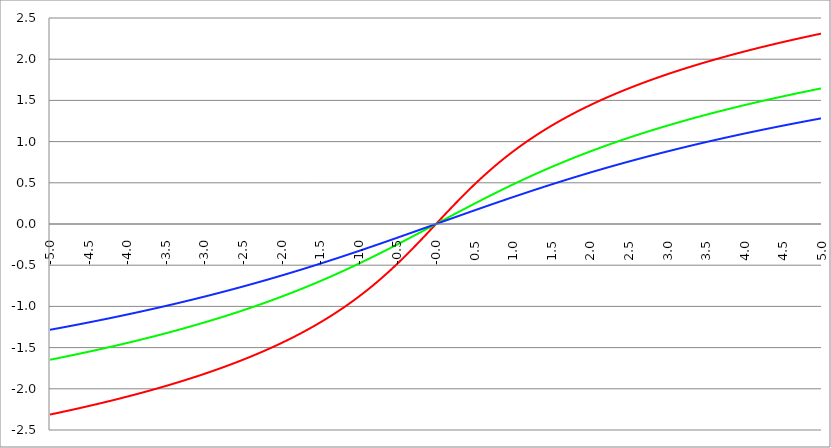
| Category | Series 1 | Series 0 | Series 2 |
|---|---|---|---|
| -5.0 | -2.312 | -1.647 | -1.284 |
| -4.995 | -2.311 | -1.646 | -1.283 |
| -4.99 | -2.31 | -1.645 | -1.282 |
| -4.985 | -2.309 | -1.644 | -1.281 |
| -4.98 | -2.309 | -1.644 | -1.28 |
| -4.975 | -2.308 | -1.643 | -1.28 |
| -4.97 | -2.307 | -1.642 | -1.279 |
| -4.965000000000001 | -2.306 | -1.641 | -1.278 |
| -4.960000000000001 | -2.305 | -1.64 | -1.277 |
| -4.955000000000001 | -2.304 | -1.639 | -1.276 |
| -4.950000000000001 | -2.303 | -1.638 | -1.275 |
| -4.945000000000001 | -2.302 | -1.637 | -1.274 |
| -4.940000000000001 | -2.301 | -1.636 | -1.273 |
| -4.935000000000001 | -2.3 | -1.635 | -1.273 |
| -4.930000000000001 | -2.299 | -1.634 | -1.272 |
| -4.925000000000002 | -2.298 | -1.633 | -1.271 |
| -4.920000000000002 | -2.297 | -1.632 | -1.27 |
| -4.915000000000002 | -2.296 | -1.631 | -1.269 |
| -4.910000000000002 | -2.295 | -1.63 | -1.268 |
| -4.905000000000002 | -2.294 | -1.629 | -1.267 |
| -4.900000000000002 | -2.293 | -1.628 | -1.267 |
| -4.895000000000002 | -2.292 | -1.628 | -1.266 |
| -4.890000000000002 | -2.291 | -1.627 | -1.265 |
| -4.885000000000002 | -2.29 | -1.626 | -1.264 |
| -4.880000000000002 | -2.289 | -1.625 | -1.263 |
| -4.875000000000003 | -2.288 | -1.624 | -1.262 |
| -4.870000000000003 | -2.287 | -1.623 | -1.261 |
| -4.865000000000003 | -2.286 | -1.622 | -1.26 |
| -4.860000000000003 | -2.285 | -1.621 | -1.26 |
| -4.855000000000003 | -2.284 | -1.62 | -1.259 |
| -4.850000000000003 | -2.283 | -1.619 | -1.258 |
| -4.845000000000003 | -2.282 | -1.618 | -1.257 |
| -4.840000000000003 | -2.281 | -1.617 | -1.256 |
| -4.835000000000003 | -2.28 | -1.616 | -1.255 |
| -4.830000000000004 | -2.279 | -1.615 | -1.254 |
| -4.825000000000004 | -2.278 | -1.614 | -1.253 |
| -4.820000000000004 | -2.277 | -1.613 | -1.253 |
| -4.815000000000004 | -2.275 | -1.612 | -1.252 |
| -4.810000000000004 | -2.274 | -1.611 | -1.251 |
| -4.805000000000004 | -2.273 | -1.61 | -1.25 |
| -4.800000000000004 | -2.272 | -1.609 | -1.249 |
| -4.795000000000004 | -2.271 | -1.608 | -1.248 |
| -4.790000000000004 | -2.27 | -1.608 | -1.247 |
| -4.785000000000004 | -2.269 | -1.607 | -1.246 |
| -4.780000000000004 | -2.268 | -1.606 | -1.245 |
| -4.775000000000004 | -2.267 | -1.605 | -1.245 |
| -4.770000000000004 | -2.266 | -1.604 | -1.244 |
| -4.765000000000005 | -2.265 | -1.603 | -1.243 |
| -4.760000000000005 | -2.264 | -1.602 | -1.242 |
| -4.755000000000005 | -2.263 | -1.601 | -1.241 |
| -4.750000000000005 | -2.262 | -1.6 | -1.24 |
| -4.745000000000005 | -2.261 | -1.599 | -1.239 |
| -4.740000000000005 | -2.26 | -1.598 | -1.238 |
| -4.735000000000005 | -2.259 | -1.597 | -1.237 |
| -4.730000000000005 | -2.258 | -1.596 | -1.237 |
| -4.725000000000006 | -2.257 | -1.595 | -1.236 |
| -4.720000000000006 | -2.256 | -1.594 | -1.235 |
| -4.715000000000006 | -2.255 | -1.593 | -1.234 |
| -4.710000000000006 | -2.254 | -1.592 | -1.233 |
| -4.705000000000006 | -2.253 | -1.591 | -1.232 |
| -4.700000000000006 | -2.252 | -1.59 | -1.231 |
| -4.695000000000006 | -2.251 | -1.589 | -1.23 |
| -4.690000000000006 | -2.25 | -1.588 | -1.229 |
| -4.685000000000007 | -2.249 | -1.587 | -1.228 |
| -4.680000000000007 | -2.248 | -1.586 | -1.228 |
| -4.675000000000007 | -2.247 | -1.585 | -1.227 |
| -4.670000000000007 | -2.246 | -1.584 | -1.226 |
| -4.665000000000007 | -2.245 | -1.583 | -1.225 |
| -4.660000000000007 | -2.243 | -1.582 | -1.224 |
| -4.655000000000007 | -2.242 | -1.581 | -1.223 |
| -4.650000000000007 | -2.241 | -1.58 | -1.222 |
| -4.645000000000007 | -2.24 | -1.579 | -1.221 |
| -4.640000000000008 | -2.239 | -1.578 | -1.22 |
| -4.635000000000008 | -2.238 | -1.577 | -1.219 |
| -4.630000000000008 | -2.237 | -1.576 | -1.219 |
| -4.625000000000008 | -2.236 | -1.575 | -1.218 |
| -4.620000000000008 | -2.235 | -1.574 | -1.217 |
| -4.615000000000008 | -2.234 | -1.573 | -1.216 |
| -4.610000000000008 | -2.233 | -1.572 | -1.215 |
| -4.605000000000008 | -2.232 | -1.571 | -1.214 |
| -4.600000000000008 | -2.231 | -1.57 | -1.213 |
| -4.595000000000009 | -2.23 | -1.569 | -1.212 |
| -4.590000000000009 | -2.229 | -1.568 | -1.211 |
| -4.585000000000009 | -2.228 | -1.567 | -1.21 |
| -4.580000000000009 | -2.227 | -1.566 | -1.209 |
| -4.57500000000001 | -2.225 | -1.565 | -1.209 |
| -4.57000000000001 | -2.224 | -1.564 | -1.208 |
| -4.565000000000009 | -2.223 | -1.563 | -1.207 |
| -4.560000000000009 | -2.222 | -1.562 | -1.206 |
| -4.555000000000009 | -2.221 | -1.561 | -1.205 |
| -4.55000000000001 | -2.22 | -1.56 | -1.204 |
| -4.54500000000001 | -2.219 | -1.559 | -1.203 |
| -4.54000000000001 | -2.218 | -1.558 | -1.202 |
| -4.53500000000001 | -2.217 | -1.557 | -1.201 |
| -4.53000000000001 | -2.216 | -1.556 | -1.2 |
| -4.52500000000001 | -2.215 | -1.555 | -1.199 |
| -4.52000000000001 | -2.214 | -1.554 | -1.198 |
| -4.51500000000001 | -2.213 | -1.553 | -1.198 |
| -4.51000000000001 | -2.212 | -1.552 | -1.197 |
| -4.505000000000011 | -2.21 | -1.551 | -1.196 |
| -4.500000000000011 | -2.209 | -1.55 | -1.195 |
| -4.495000000000011 | -2.208 | -1.549 | -1.194 |
| -4.490000000000011 | -2.207 | -1.548 | -1.193 |
| -4.485000000000011 | -2.206 | -1.547 | -1.192 |
| -4.480000000000011 | -2.205 | -1.546 | -1.191 |
| -4.475000000000011 | -2.204 | -1.545 | -1.19 |
| -4.470000000000011 | -2.203 | -1.544 | -1.189 |
| -4.465000000000011 | -2.202 | -1.543 | -1.188 |
| -4.460000000000011 | -2.201 | -1.542 | -1.187 |
| -4.455000000000012 | -2.2 | -1.541 | -1.186 |
| -4.450000000000012 | -2.198 | -1.54 | -1.185 |
| -4.445000000000012 | -2.197 | -1.539 | -1.185 |
| -4.440000000000012 | -2.196 | -1.538 | -1.184 |
| -4.435000000000012 | -2.195 | -1.537 | -1.183 |
| -4.430000000000012 | -2.194 | -1.536 | -1.182 |
| -4.425000000000012 | -2.193 | -1.535 | -1.181 |
| -4.420000000000012 | -2.192 | -1.534 | -1.18 |
| -4.415000000000012 | -2.191 | -1.533 | -1.179 |
| -4.410000000000013 | -2.19 | -1.532 | -1.178 |
| -4.405000000000013 | -2.189 | -1.531 | -1.177 |
| -4.400000000000013 | -2.187 | -1.53 | -1.176 |
| -4.395000000000013 | -2.186 | -1.529 | -1.175 |
| -4.390000000000013 | -2.185 | -1.528 | -1.174 |
| -4.385000000000013 | -2.184 | -1.527 | -1.173 |
| -4.380000000000013 | -2.183 | -1.526 | -1.172 |
| -4.375000000000013 | -2.182 | -1.524 | -1.171 |
| -4.370000000000013 | -2.181 | -1.523 | -1.17 |
| -4.365000000000013 | -2.18 | -1.522 | -1.17 |
| -4.360000000000014 | -2.179 | -1.521 | -1.169 |
| -4.355000000000014 | -2.177 | -1.52 | -1.168 |
| -4.350000000000014 | -2.176 | -1.519 | -1.167 |
| -4.345000000000014 | -2.175 | -1.518 | -1.166 |
| -4.340000000000014 | -2.174 | -1.517 | -1.165 |
| -4.335000000000014 | -2.173 | -1.516 | -1.164 |
| -4.330000000000014 | -2.172 | -1.515 | -1.163 |
| -4.325000000000014 | -2.171 | -1.514 | -1.162 |
| -4.320000000000014 | -2.17 | -1.513 | -1.161 |
| -4.315000000000015 | -2.168 | -1.512 | -1.16 |
| -4.310000000000015 | -2.167 | -1.511 | -1.159 |
| -4.305000000000015 | -2.166 | -1.51 | -1.158 |
| -4.300000000000015 | -2.165 | -1.509 | -1.157 |
| -4.295000000000015 | -2.164 | -1.508 | -1.156 |
| -4.290000000000015 | -2.163 | -1.507 | -1.155 |
| -4.285000000000015 | -2.162 | -1.506 | -1.154 |
| -4.280000000000015 | -2.16 | -1.505 | -1.153 |
| -4.275000000000015 | -2.159 | -1.503 | -1.152 |
| -4.270000000000015 | -2.158 | -1.502 | -1.151 |
| -4.265000000000016 | -2.157 | -1.501 | -1.151 |
| -4.260000000000016 | -2.156 | -1.5 | -1.15 |
| -4.255000000000016 | -2.155 | -1.499 | -1.149 |
| -4.250000000000016 | -2.154 | -1.498 | -1.148 |
| -4.245000000000016 | -2.152 | -1.497 | -1.147 |
| -4.240000000000016 | -2.151 | -1.496 | -1.146 |
| -4.235000000000016 | -2.15 | -1.495 | -1.145 |
| -4.230000000000016 | -2.149 | -1.494 | -1.144 |
| -4.225000000000017 | -2.148 | -1.493 | -1.143 |
| -4.220000000000017 | -2.147 | -1.492 | -1.142 |
| -4.215000000000017 | -2.146 | -1.491 | -1.141 |
| -4.210000000000017 | -2.144 | -1.49 | -1.14 |
| -4.205000000000017 | -2.143 | -1.489 | -1.139 |
| -4.200000000000017 | -2.142 | -1.487 | -1.138 |
| -4.195000000000017 | -2.141 | -1.486 | -1.137 |
| -4.190000000000017 | -2.14 | -1.485 | -1.136 |
| -4.185000000000017 | -2.139 | -1.484 | -1.135 |
| -4.180000000000017 | -2.137 | -1.483 | -1.134 |
| -4.175000000000018 | -2.136 | -1.482 | -1.133 |
| -4.170000000000018 | -2.135 | -1.481 | -1.132 |
| -4.165000000000018 | -2.134 | -1.48 | -1.131 |
| -4.160000000000018 | -2.133 | -1.479 | -1.13 |
| -4.155000000000018 | -2.132 | -1.478 | -1.129 |
| -4.150000000000018 | -2.13 | -1.477 | -1.128 |
| -4.145000000000018 | -2.129 | -1.476 | -1.127 |
| -4.140000000000018 | -2.128 | -1.475 | -1.126 |
| -4.135000000000018 | -2.127 | -1.473 | -1.125 |
| -4.130000000000019 | -2.126 | -1.472 | -1.124 |
| -4.125000000000019 | -2.125 | -1.471 | -1.123 |
| -4.120000000000019 | -2.123 | -1.47 | -1.122 |
| -4.115000000000019 | -2.122 | -1.469 | -1.121 |
| -4.110000000000019 | -2.121 | -1.468 | -1.12 |
| -4.105000000000019 | -2.12 | -1.467 | -1.119 |
| -4.100000000000019 | -2.119 | -1.466 | -1.118 |
| -4.095000000000019 | -2.117 | -1.465 | -1.117 |
| -4.090000000000019 | -2.116 | -1.464 | -1.116 |
| -4.085000000000019 | -2.115 | -1.462 | -1.115 |
| -4.08000000000002 | -2.114 | -1.461 | -1.115 |
| -4.07500000000002 | -2.113 | -1.46 | -1.114 |
| -4.07000000000002 | -2.112 | -1.459 | -1.113 |
| -4.06500000000002 | -2.11 | -1.458 | -1.112 |
| -4.06000000000002 | -2.109 | -1.457 | -1.111 |
| -4.05500000000002 | -2.108 | -1.456 | -1.11 |
| -4.05000000000002 | -2.107 | -1.455 | -1.109 |
| -4.04500000000002 | -2.106 | -1.454 | -1.108 |
| -4.04000000000002 | -2.104 | -1.453 | -1.107 |
| -4.03500000000002 | -2.103 | -1.451 | -1.106 |
| -4.03000000000002 | -2.102 | -1.45 | -1.105 |
| -4.025000000000021 | -2.101 | -1.449 | -1.104 |
| -4.020000000000021 | -2.1 | -1.448 | -1.103 |
| -4.015000000000021 | -2.098 | -1.447 | -1.102 |
| -4.010000000000021 | -2.097 | -1.446 | -1.101 |
| -4.005000000000021 | -2.096 | -1.445 | -1.1 |
| -4.000000000000021 | -2.095 | -1.444 | -1.099 |
| -3.995000000000021 | -2.093 | -1.443 | -1.098 |
| -3.990000000000021 | -2.092 | -1.441 | -1.097 |
| -3.985000000000022 | -2.091 | -1.44 | -1.096 |
| -3.980000000000022 | -2.09 | -1.439 | -1.095 |
| -3.975000000000022 | -2.089 | -1.438 | -1.094 |
| -3.970000000000022 | -2.087 | -1.437 | -1.093 |
| -3.965000000000022 | -2.086 | -1.436 | -1.092 |
| -3.960000000000022 | -2.085 | -1.435 | -1.091 |
| -3.955000000000022 | -2.084 | -1.434 | -1.09 |
| -3.950000000000022 | -2.083 | -1.432 | -1.089 |
| -3.945000000000022 | -2.081 | -1.431 | -1.088 |
| -3.940000000000023 | -2.08 | -1.43 | -1.087 |
| -3.935000000000023 | -2.079 | -1.429 | -1.086 |
| -3.930000000000023 | -2.078 | -1.428 | -1.085 |
| -3.925000000000023 | -2.076 | -1.427 | -1.084 |
| -3.920000000000023 | -2.075 | -1.426 | -1.083 |
| -3.915000000000023 | -2.074 | -1.424 | -1.081 |
| -3.910000000000023 | -2.073 | -1.423 | -1.08 |
| -3.905000000000023 | -2.071 | -1.422 | -1.079 |
| -3.900000000000023 | -2.07 | -1.421 | -1.078 |
| -3.895000000000023 | -2.069 | -1.42 | -1.077 |
| -3.890000000000024 | -2.068 | -1.419 | -1.076 |
| -3.885000000000024 | -2.066 | -1.418 | -1.075 |
| -3.880000000000024 | -2.065 | -1.416 | -1.074 |
| -3.875000000000024 | -2.064 | -1.415 | -1.073 |
| -3.870000000000024 | -2.063 | -1.414 | -1.072 |
| -3.865000000000024 | -2.061 | -1.413 | -1.071 |
| -3.860000000000024 | -2.06 | -1.412 | -1.07 |
| -3.855000000000024 | -2.059 | -1.411 | -1.069 |
| -3.850000000000024 | -2.058 | -1.41 | -1.068 |
| -3.845000000000025 | -2.056 | -1.408 | -1.067 |
| -3.840000000000025 | -2.055 | -1.407 | -1.066 |
| -3.835000000000025 | -2.054 | -1.406 | -1.065 |
| -3.830000000000025 | -2.053 | -1.405 | -1.064 |
| -3.825000000000025 | -2.051 | -1.404 | -1.063 |
| -3.820000000000025 | -2.05 | -1.403 | -1.062 |
| -3.815000000000025 | -2.049 | -1.401 | -1.061 |
| -3.810000000000025 | -2.048 | -1.4 | -1.06 |
| -3.805000000000025 | -2.046 | -1.399 | -1.059 |
| -3.800000000000026 | -2.045 | -1.398 | -1.058 |
| -3.795000000000026 | -2.044 | -1.397 | -1.057 |
| -3.790000000000026 | -2.042 | -1.396 | -1.056 |
| -3.785000000000026 | -2.041 | -1.394 | -1.055 |
| -3.780000000000026 | -2.04 | -1.393 | -1.054 |
| -3.775000000000026 | -2.039 | -1.392 | -1.053 |
| -3.770000000000026 | -2.037 | -1.391 | -1.052 |
| -3.765000000000026 | -2.036 | -1.39 | -1.051 |
| -3.760000000000026 | -2.035 | -1.389 | -1.05 |
| -3.755000000000026 | -2.034 | -1.387 | -1.049 |
| -3.750000000000027 | -2.032 | -1.386 | -1.048 |
| -3.745000000000027 | -2.031 | -1.385 | -1.047 |
| -3.740000000000027 | -2.03 | -1.384 | -1.046 |
| -3.735000000000027 | -2.028 | -1.383 | -1.044 |
| -3.730000000000027 | -2.027 | -1.382 | -1.043 |
| -3.725000000000027 | -2.026 | -1.38 | -1.042 |
| -3.720000000000027 | -2.024 | -1.379 | -1.041 |
| -3.715000000000027 | -2.023 | -1.378 | -1.04 |
| -3.710000000000027 | -2.022 | -1.377 | -1.039 |
| -3.705000000000028 | -2.021 | -1.376 | -1.038 |
| -3.700000000000028 | -2.019 | -1.374 | -1.037 |
| -3.695000000000028 | -2.018 | -1.373 | -1.036 |
| -3.690000000000028 | -2.017 | -1.372 | -1.035 |
| -3.685000000000028 | -2.015 | -1.371 | -1.034 |
| -3.680000000000028 | -2.014 | -1.37 | -1.033 |
| -3.675000000000028 | -2.013 | -1.369 | -1.032 |
| -3.670000000000028 | -2.011 | -1.367 | -1.031 |
| -3.665000000000028 | -2.01 | -1.366 | -1.03 |
| -3.660000000000028 | -2.009 | -1.365 | -1.029 |
| -3.655000000000029 | -2.007 | -1.364 | -1.028 |
| -3.650000000000029 | -2.006 | -1.363 | -1.027 |
| -3.645000000000029 | -2.005 | -1.361 | -1.026 |
| -3.640000000000029 | -2.003 | -1.36 | -1.024 |
| -3.635000000000029 | -2.002 | -1.359 | -1.023 |
| -3.630000000000029 | -2.001 | -1.358 | -1.022 |
| -3.625000000000029 | -2 | -1.356 | -1.021 |
| -3.620000000000029 | -1.998 | -1.355 | -1.02 |
| -3.615000000000029 | -1.997 | -1.354 | -1.019 |
| -3.61000000000003 | -1.996 | -1.353 | -1.018 |
| -3.60500000000003 | -1.994 | -1.352 | -1.017 |
| -3.60000000000003 | -1.993 | -1.35 | -1.016 |
| -3.59500000000003 | -1.991 | -1.349 | -1.015 |
| -3.59000000000003 | -1.99 | -1.348 | -1.014 |
| -3.58500000000003 | -1.989 | -1.347 | -1.013 |
| -3.58000000000003 | -1.987 | -1.346 | -1.012 |
| -3.57500000000003 | -1.986 | -1.344 | -1.011 |
| -3.57000000000003 | -1.985 | -1.343 | -1.01 |
| -3.565000000000031 | -1.983 | -1.342 | -1.008 |
| -3.560000000000031 | -1.982 | -1.341 | -1.007 |
| -3.555000000000031 | -1.981 | -1.339 | -1.006 |
| -3.550000000000031 | -1.979 | -1.338 | -1.005 |
| -3.545000000000031 | -1.978 | -1.337 | -1.004 |
| -3.540000000000031 | -1.977 | -1.336 | -1.003 |
| -3.535000000000031 | -1.975 | -1.335 | -1.002 |
| -3.530000000000031 | -1.974 | -1.333 | -1.001 |
| -3.525000000000031 | -1.973 | -1.332 | -1 |
| -3.520000000000032 | -1.971 | -1.331 | -0.999 |
| -3.515000000000032 | -1.97 | -1.33 | -0.998 |
| -3.510000000000032 | -1.968 | -1.328 | -0.997 |
| -3.505000000000032 | -1.967 | -1.327 | -0.996 |
| -3.500000000000032 | -1.966 | -1.326 | -0.994 |
| -3.495000000000032 | -1.964 | -1.325 | -0.993 |
| -3.490000000000032 | -1.963 | -1.323 | -0.992 |
| -3.485000000000032 | -1.962 | -1.322 | -0.991 |
| -3.480000000000032 | -1.96 | -1.321 | -0.99 |
| -3.475000000000032 | -1.959 | -1.32 | -0.989 |
| -3.470000000000033 | -1.957 | -1.318 | -0.988 |
| -3.465000000000033 | -1.956 | -1.317 | -0.987 |
| -3.460000000000033 | -1.955 | -1.316 | -0.986 |
| -3.455000000000033 | -1.953 | -1.315 | -0.985 |
| -3.450000000000033 | -1.952 | -1.313 | -0.984 |
| -3.445000000000033 | -1.951 | -1.312 | -0.982 |
| -3.440000000000033 | -1.949 | -1.311 | -0.981 |
| -3.435000000000033 | -1.948 | -1.31 | -0.98 |
| -3.430000000000033 | -1.946 | -1.308 | -0.979 |
| -3.425000000000034 | -1.945 | -1.307 | -0.978 |
| -3.420000000000034 | -1.944 | -1.306 | -0.977 |
| -3.415000000000034 | -1.942 | -1.305 | -0.976 |
| -3.410000000000034 | -1.941 | -1.303 | -0.975 |
| -3.405000000000034 | -1.939 | -1.302 | -0.974 |
| -3.400000000000034 | -1.938 | -1.301 | -0.973 |
| -3.395000000000034 | -1.936 | -1.3 | -0.971 |
| -3.390000000000034 | -1.935 | -1.298 | -0.97 |
| -3.385000000000034 | -1.934 | -1.297 | -0.969 |
| -3.380000000000034 | -1.932 | -1.296 | -0.968 |
| -3.375000000000035 | -1.931 | -1.294 | -0.967 |
| -3.370000000000035 | -1.929 | -1.293 | -0.966 |
| -3.365000000000035 | -1.928 | -1.292 | -0.965 |
| -3.360000000000035 | -1.927 | -1.291 | -0.964 |
| -3.355000000000035 | -1.925 | -1.289 | -0.963 |
| -3.350000000000035 | -1.924 | -1.288 | -0.962 |
| -3.345000000000035 | -1.922 | -1.287 | -0.96 |
| -3.340000000000035 | -1.921 | -1.286 | -0.959 |
| -3.335000000000035 | -1.919 | -1.284 | -0.958 |
| -3.330000000000036 | -1.918 | -1.283 | -0.957 |
| -3.325000000000036 | -1.916 | -1.282 | -0.956 |
| -3.320000000000036 | -1.915 | -1.28 | -0.955 |
| -3.315000000000036 | -1.914 | -1.279 | -0.954 |
| -3.310000000000036 | -1.912 | -1.278 | -0.953 |
| -3.305000000000036 | -1.911 | -1.276 | -0.951 |
| -3.300000000000036 | -1.909 | -1.275 | -0.95 |
| -3.295000000000036 | -1.908 | -1.274 | -0.949 |
| -3.290000000000036 | -1.906 | -1.273 | -0.948 |
| -3.285000000000036 | -1.905 | -1.271 | -0.947 |
| -3.280000000000036 | -1.903 | -1.27 | -0.946 |
| -3.275000000000037 | -1.902 | -1.269 | -0.945 |
| -3.270000000000037 | -1.901 | -1.267 | -0.944 |
| -3.265000000000037 | -1.899 | -1.266 | -0.942 |
| -3.260000000000037 | -1.898 | -1.265 | -0.941 |
| -3.255000000000037 | -1.896 | -1.263 | -0.94 |
| -3.250000000000037 | -1.895 | -1.262 | -0.939 |
| -3.245000000000037 | -1.893 | -1.261 | -0.938 |
| -3.240000000000037 | -1.892 | -1.26 | -0.937 |
| -3.235000000000038 | -1.89 | -1.258 | -0.936 |
| -3.230000000000038 | -1.889 | -1.257 | -0.935 |
| -3.225000000000038 | -1.887 | -1.256 | -0.933 |
| -3.220000000000038 | -1.886 | -1.254 | -0.932 |
| -3.215000000000038 | -1.884 | -1.253 | -0.931 |
| -3.210000000000038 | -1.883 | -1.252 | -0.93 |
| -3.205000000000038 | -1.881 | -1.25 | -0.929 |
| -3.200000000000038 | -1.88 | -1.249 | -0.928 |
| -3.195000000000038 | -1.878 | -1.248 | -0.927 |
| -3.190000000000039 | -1.877 | -1.246 | -0.925 |
| -3.185000000000039 | -1.875 | -1.245 | -0.924 |
| -3.180000000000039 | -1.874 | -1.244 | -0.923 |
| -3.175000000000039 | -1.872 | -1.242 | -0.922 |
| -3.170000000000039 | -1.871 | -1.241 | -0.921 |
| -3.16500000000004 | -1.869 | -1.24 | -0.92 |
| -3.16000000000004 | -1.868 | -1.238 | -0.919 |
| -3.155000000000039 | -1.866 | -1.237 | -0.917 |
| -3.150000000000039 | -1.865 | -1.236 | -0.916 |
| -3.14500000000004 | -1.863 | -1.234 | -0.915 |
| -3.14000000000004 | -1.862 | -1.233 | -0.914 |
| -3.13500000000004 | -1.86 | -1.232 | -0.913 |
| -3.13000000000004 | -1.859 | -1.23 | -0.912 |
| -3.12500000000004 | -1.857 | -1.229 | -0.911 |
| -3.12000000000004 | -1.856 | -1.228 | -0.909 |
| -3.11500000000004 | -1.854 | -1.226 | -0.908 |
| -3.11000000000004 | -1.853 | -1.225 | -0.907 |
| -3.10500000000004 | -1.851 | -1.224 | -0.906 |
| -3.10000000000004 | -1.85 | -1.222 | -0.905 |
| -3.095000000000041 | -1.848 | -1.221 | -0.904 |
| -3.090000000000041 | -1.847 | -1.219 | -0.902 |
| -3.085000000000041 | -1.845 | -1.218 | -0.901 |
| -3.080000000000041 | -1.843 | -1.217 | -0.9 |
| -3.075000000000041 | -1.842 | -1.215 | -0.899 |
| -3.070000000000041 | -1.84 | -1.214 | -0.898 |
| -3.065000000000041 | -1.839 | -1.213 | -0.897 |
| -3.060000000000041 | -1.837 | -1.211 | -0.895 |
| -3.055000000000041 | -1.836 | -1.21 | -0.894 |
| -3.050000000000042 | -1.834 | -1.209 | -0.893 |
| -3.045000000000042 | -1.833 | -1.207 | -0.892 |
| -3.040000000000042 | -1.831 | -1.206 | -0.891 |
| -3.035000000000042 | -1.829 | -1.204 | -0.89 |
| -3.030000000000042 | -1.828 | -1.203 | -0.888 |
| -3.025000000000042 | -1.826 | -1.202 | -0.887 |
| -3.020000000000042 | -1.825 | -1.2 | -0.886 |
| -3.015000000000042 | -1.823 | -1.199 | -0.885 |
| -3.010000000000042 | -1.822 | -1.198 | -0.884 |
| -3.005000000000043 | -1.82 | -1.196 | -0.883 |
| -3.000000000000043 | -1.818 | -1.195 | -0.881 |
| -2.995000000000043 | -1.817 | -1.193 | -0.88 |
| -2.990000000000043 | -1.815 | -1.192 | -0.879 |
| -2.985000000000043 | -1.814 | -1.191 | -0.878 |
| -2.980000000000043 | -1.812 | -1.189 | -0.877 |
| -2.975000000000043 | -1.811 | -1.188 | -0.875 |
| -2.970000000000043 | -1.809 | -1.186 | -0.874 |
| -2.965000000000043 | -1.807 | -1.185 | -0.873 |
| -2.960000000000043 | -1.806 | -1.184 | -0.872 |
| -2.955000000000044 | -1.804 | -1.182 | -0.871 |
| -2.950000000000044 | -1.803 | -1.181 | -0.87 |
| -2.945000000000044 | -1.801 | -1.179 | -0.868 |
| -2.940000000000044 | -1.799 | -1.178 | -0.867 |
| -2.935000000000044 | -1.798 | -1.177 | -0.866 |
| -2.930000000000044 | -1.796 | -1.175 | -0.865 |
| -2.925000000000044 | -1.794 | -1.174 | -0.864 |
| -2.920000000000044 | -1.793 | -1.172 | -0.862 |
| -2.915000000000044 | -1.791 | -1.171 | -0.861 |
| -2.910000000000045 | -1.79 | -1.17 | -0.86 |
| -2.905000000000045 | -1.788 | -1.168 | -0.859 |
| -2.900000000000045 | -1.786 | -1.167 | -0.858 |
| -2.895000000000045 | -1.785 | -1.165 | -0.856 |
| -2.890000000000045 | -1.783 | -1.164 | -0.855 |
| -2.885000000000045 | -1.781 | -1.162 | -0.854 |
| -2.880000000000045 | -1.78 | -1.161 | -0.853 |
| -2.875000000000045 | -1.778 | -1.16 | -0.852 |
| -2.870000000000045 | -1.777 | -1.158 | -0.85 |
| -2.865000000000045 | -1.775 | -1.157 | -0.849 |
| -2.860000000000046 | -1.773 | -1.155 | -0.848 |
| -2.855000000000046 | -1.772 | -1.154 | -0.847 |
| -2.850000000000046 | -1.77 | -1.152 | -0.846 |
| -2.845000000000046 | -1.768 | -1.151 | -0.844 |
| -2.840000000000046 | -1.767 | -1.15 | -0.843 |
| -2.835000000000046 | -1.765 | -1.148 | -0.842 |
| -2.830000000000046 | -1.763 | -1.147 | -0.841 |
| -2.825000000000046 | -1.762 | -1.145 | -0.84 |
| -2.820000000000046 | -1.76 | -1.144 | -0.838 |
| -2.815000000000047 | -1.758 | -1.142 | -0.837 |
| -2.810000000000047 | -1.757 | -1.141 | -0.836 |
| -2.805000000000047 | -1.755 | -1.139 | -0.835 |
| -2.800000000000047 | -1.753 | -1.138 | -0.833 |
| -2.795000000000047 | -1.752 | -1.137 | -0.832 |
| -2.790000000000047 | -1.75 | -1.135 | -0.831 |
| -2.785000000000047 | -1.748 | -1.134 | -0.83 |
| -2.780000000000047 | -1.746 | -1.132 | -0.829 |
| -2.775000000000047 | -1.745 | -1.131 | -0.827 |
| -2.770000000000047 | -1.743 | -1.129 | -0.826 |
| -2.765000000000048 | -1.741 | -1.128 | -0.825 |
| -2.760000000000048 | -1.74 | -1.126 | -0.824 |
| -2.755000000000048 | -1.738 | -1.125 | -0.822 |
| -2.750000000000048 | -1.736 | -1.123 | -0.821 |
| -2.745000000000048 | -1.735 | -1.122 | -0.82 |
| -2.740000000000048 | -1.733 | -1.12 | -0.819 |
| -2.735000000000048 | -1.731 | -1.119 | -0.818 |
| -2.730000000000048 | -1.729 | -1.117 | -0.816 |
| -2.725000000000048 | -1.728 | -1.116 | -0.815 |
| -2.720000000000049 | -1.726 | -1.115 | -0.814 |
| -2.715000000000049 | -1.724 | -1.113 | -0.813 |
| -2.710000000000049 | -1.723 | -1.112 | -0.811 |
| -2.705000000000049 | -1.721 | -1.11 | -0.81 |
| -2.700000000000049 | -1.719 | -1.109 | -0.809 |
| -2.695000000000049 | -1.717 | -1.107 | -0.808 |
| -2.690000000000049 | -1.716 | -1.106 | -0.806 |
| -2.685000000000049 | -1.714 | -1.104 | -0.805 |
| -2.680000000000049 | -1.712 | -1.103 | -0.804 |
| -2.675000000000049 | -1.71 | -1.101 | -0.803 |
| -2.67000000000005 | -1.709 | -1.1 | -0.801 |
| -2.66500000000005 | -1.707 | -1.098 | -0.8 |
| -2.66000000000005 | -1.705 | -1.097 | -0.799 |
| -2.65500000000005 | -1.703 | -1.095 | -0.798 |
| -2.65000000000005 | -1.702 | -1.094 | -0.796 |
| -2.64500000000005 | -1.7 | -1.092 | -0.795 |
| -2.64000000000005 | -1.698 | -1.091 | -0.794 |
| -2.63500000000005 | -1.696 | -1.089 | -0.793 |
| -2.63000000000005 | -1.694 | -1.088 | -0.791 |
| -2.625000000000051 | -1.693 | -1.086 | -0.79 |
| -2.620000000000051 | -1.691 | -1.085 | -0.789 |
| -2.615000000000051 | -1.689 | -1.083 | -0.788 |
| -2.610000000000051 | -1.687 | -1.081 | -0.786 |
| -2.605000000000051 | -1.686 | -1.08 | -0.785 |
| -2.600000000000051 | -1.684 | -1.078 | -0.784 |
| -2.595000000000051 | -1.682 | -1.077 | -0.783 |
| -2.590000000000051 | -1.68 | -1.075 | -0.781 |
| -2.585000000000051 | -1.678 | -1.074 | -0.78 |
| -2.580000000000052 | -1.677 | -1.072 | -0.779 |
| -2.575000000000052 | -1.675 | -1.071 | -0.778 |
| -2.570000000000052 | -1.673 | -1.069 | -0.776 |
| -2.565000000000052 | -1.671 | -1.068 | -0.775 |
| -2.560000000000052 | -1.669 | -1.066 | -0.774 |
| -2.555000000000052 | -1.667 | -1.065 | -0.773 |
| -2.550000000000052 | -1.666 | -1.063 | -0.771 |
| -2.545000000000052 | -1.664 | -1.062 | -0.77 |
| -2.540000000000052 | -1.662 | -1.06 | -0.769 |
| -2.535000000000053 | -1.66 | -1.058 | -0.767 |
| -2.530000000000053 | -1.658 | -1.057 | -0.766 |
| -2.525000000000053 | -1.656 | -1.055 | -0.765 |
| -2.520000000000053 | -1.655 | -1.054 | -0.764 |
| -2.515000000000053 | -1.653 | -1.052 | -0.762 |
| -2.510000000000053 | -1.651 | -1.051 | -0.761 |
| -2.505000000000053 | -1.649 | -1.049 | -0.76 |
| -2.500000000000053 | -1.647 | -1.048 | -0.758 |
| -2.495000000000053 | -1.645 | -1.046 | -0.757 |
| -2.490000000000053 | -1.644 | -1.044 | -0.756 |
| -2.485000000000054 | -1.642 | -1.043 | -0.755 |
| -2.480000000000054 | -1.64 | -1.041 | -0.753 |
| -2.475000000000054 | -1.638 | -1.04 | -0.752 |
| -2.470000000000054 | -1.636 | -1.038 | -0.751 |
| -2.465000000000054 | -1.634 | -1.037 | -0.749 |
| -2.460000000000054 | -1.632 | -1.035 | -0.748 |
| -2.455000000000054 | -1.63 | -1.033 | -0.747 |
| -2.450000000000054 | -1.628 | -1.032 | -0.746 |
| -2.445000000000054 | -1.627 | -1.03 | -0.744 |
| -2.440000000000055 | -1.625 | -1.029 | -0.743 |
| -2.435000000000055 | -1.623 | -1.027 | -0.742 |
| -2.430000000000055 | -1.621 | -1.026 | -0.74 |
| -2.425000000000055 | -1.619 | -1.024 | -0.739 |
| -2.420000000000055 | -1.617 | -1.022 | -0.738 |
| -2.415000000000055 | -1.615 | -1.021 | -0.737 |
| -2.410000000000055 | -1.613 | -1.019 | -0.735 |
| -2.405000000000055 | -1.611 | -1.018 | -0.734 |
| -2.400000000000055 | -1.609 | -1.016 | -0.733 |
| -2.395000000000055 | -1.608 | -1.014 | -0.731 |
| -2.390000000000056 | -1.606 | -1.013 | -0.73 |
| -2.385000000000056 | -1.604 | -1.011 | -0.729 |
| -2.380000000000056 | -1.602 | -1.01 | -0.727 |
| -2.375000000000056 | -1.6 | -1.008 | -0.726 |
| -2.370000000000056 | -1.598 | -1.006 | -0.725 |
| -2.365000000000056 | -1.596 | -1.005 | -0.724 |
| -2.360000000000056 | -1.594 | -1.003 | -0.722 |
| -2.355000000000056 | -1.592 | -1.001 | -0.721 |
| -2.350000000000056 | -1.59 | -1 | -0.72 |
| -2.345000000000057 | -1.588 | -0.998 | -0.718 |
| -2.340000000000057 | -1.586 | -0.997 | -0.717 |
| -2.335000000000057 | -1.584 | -0.995 | -0.716 |
| -2.330000000000057 | -1.582 | -0.993 | -0.714 |
| -2.325000000000057 | -1.58 | -0.992 | -0.713 |
| -2.320000000000057 | -1.578 | -0.99 | -0.712 |
| -2.315000000000057 | -1.576 | -0.988 | -0.71 |
| -2.310000000000057 | -1.574 | -0.987 | -0.709 |
| -2.305000000000057 | -1.572 | -0.985 | -0.708 |
| -2.300000000000058 | -1.57 | -0.984 | -0.706 |
| -2.295000000000058 | -1.568 | -0.982 | -0.705 |
| -2.290000000000058 | -1.566 | -0.98 | -0.704 |
| -2.285000000000058 | -1.564 | -0.979 | -0.702 |
| -2.280000000000058 | -1.562 | -0.977 | -0.701 |
| -2.275000000000058 | -1.56 | -0.975 | -0.7 |
| -2.270000000000058 | -1.558 | -0.974 | -0.698 |
| -2.265000000000058 | -1.556 | -0.972 | -0.697 |
| -2.260000000000058 | -1.554 | -0.97 | -0.696 |
| -2.255000000000058 | -1.552 | -0.969 | -0.694 |
| -2.250000000000059 | -1.55 | -0.967 | -0.693 |
| -2.245000000000059 | -1.548 | -0.965 | -0.692 |
| -2.240000000000059 | -1.546 | -0.964 | -0.69 |
| -2.235000000000059 | -1.544 | -0.962 | -0.689 |
| -2.23000000000006 | -1.542 | -0.96 | -0.688 |
| -2.22500000000006 | -1.54 | -0.959 | -0.686 |
| -2.22000000000006 | -1.538 | -0.957 | -0.685 |
| -2.215000000000059 | -1.536 | -0.955 | -0.684 |
| -2.210000000000059 | -1.534 | -0.954 | -0.682 |
| -2.20500000000006 | -1.532 | -0.952 | -0.681 |
| -2.20000000000006 | -1.53 | -0.95 | -0.68 |
| -2.19500000000006 | -1.528 | -0.949 | -0.678 |
| -2.19000000000006 | -1.526 | -0.947 | -0.677 |
| -2.18500000000006 | -1.523 | -0.945 | -0.676 |
| -2.18000000000006 | -1.521 | -0.944 | -0.674 |
| -2.17500000000006 | -1.519 | -0.942 | -0.673 |
| -2.17000000000006 | -1.517 | -0.94 | -0.672 |
| -2.16500000000006 | -1.515 | -0.939 | -0.67 |
| -2.160000000000061 | -1.513 | -0.937 | -0.669 |
| -2.155000000000061 | -1.511 | -0.935 | -0.668 |
| -2.150000000000061 | -1.509 | -0.933 | -0.666 |
| -2.145000000000061 | -1.507 | -0.932 | -0.665 |
| -2.140000000000061 | -1.505 | -0.93 | -0.664 |
| -2.135000000000061 | -1.502 | -0.928 | -0.662 |
| -2.130000000000061 | -1.5 | -0.927 | -0.661 |
| -2.125000000000061 | -1.498 | -0.925 | -0.659 |
| -2.120000000000061 | -1.496 | -0.923 | -0.658 |
| -2.115000000000061 | -1.494 | -0.921 | -0.657 |
| -2.110000000000062 | -1.492 | -0.92 | -0.655 |
| -2.105000000000062 | -1.49 | -0.918 | -0.654 |
| -2.100000000000062 | -1.487 | -0.916 | -0.653 |
| -2.095000000000062 | -1.485 | -0.915 | -0.651 |
| -2.090000000000062 | -1.483 | -0.913 | -0.65 |
| -2.085000000000062 | -1.481 | -0.911 | -0.649 |
| -2.080000000000062 | -1.479 | -0.909 | -0.647 |
| -2.075000000000062 | -1.477 | -0.908 | -0.646 |
| -2.070000000000062 | -1.475 | -0.906 | -0.644 |
| -2.065000000000063 | -1.472 | -0.904 | -0.643 |
| -2.060000000000063 | -1.47 | -0.902 | -0.642 |
| -2.055000000000063 | -1.468 | -0.901 | -0.64 |
| -2.050000000000063 | -1.466 | -0.899 | -0.639 |
| -2.045000000000063 | -1.464 | -0.897 | -0.638 |
| -2.040000000000063 | -1.461 | -0.895 | -0.636 |
| -2.035000000000063 | -1.459 | -0.894 | -0.635 |
| -2.030000000000063 | -1.457 | -0.892 | -0.633 |
| -2.025000000000063 | -1.455 | -0.89 | -0.632 |
| -2.020000000000064 | -1.453 | -0.888 | -0.631 |
| -2.015000000000064 | -1.45 | -0.887 | -0.629 |
| -2.010000000000064 | -1.448 | -0.885 | -0.628 |
| -2.005000000000064 | -1.446 | -0.883 | -0.627 |
| -2.000000000000064 | -1.444 | -0.881 | -0.625 |
| -1.995000000000064 | -1.441 | -0.88 | -0.624 |
| -1.990000000000064 | -1.439 | -0.878 | -0.622 |
| -1.985000000000064 | -1.437 | -0.876 | -0.621 |
| -1.980000000000064 | -1.435 | -0.874 | -0.62 |
| -1.975000000000064 | -1.432 | -0.873 | -0.618 |
| -1.970000000000065 | -1.43 | -0.871 | -0.617 |
| -1.965000000000065 | -1.428 | -0.869 | -0.615 |
| -1.960000000000065 | -1.426 | -0.867 | -0.614 |
| -1.955000000000065 | -1.423 | -0.865 | -0.613 |
| -1.950000000000065 | -1.421 | -0.864 | -0.611 |
| -1.945000000000065 | -1.419 | -0.862 | -0.61 |
| -1.940000000000065 | -1.416 | -0.86 | -0.608 |
| -1.935000000000065 | -1.414 | -0.858 | -0.607 |
| -1.930000000000065 | -1.412 | -0.856 | -0.606 |
| -1.925000000000066 | -1.41 | -0.855 | -0.604 |
| -1.920000000000066 | -1.407 | -0.853 | -0.603 |
| -1.915000000000066 | -1.405 | -0.851 | -0.601 |
| -1.910000000000066 | -1.403 | -0.849 | -0.6 |
| -1.905000000000066 | -1.4 | -0.847 | -0.599 |
| -1.900000000000066 | -1.398 | -0.846 | -0.597 |
| -1.895000000000066 | -1.396 | -0.844 | -0.596 |
| -1.890000000000066 | -1.393 | -0.842 | -0.594 |
| -1.885000000000066 | -1.391 | -0.84 | -0.593 |
| -1.880000000000066 | -1.389 | -0.838 | -0.592 |
| -1.875000000000067 | -1.386 | -0.836 | -0.59 |
| -1.870000000000067 | -1.384 | -0.835 | -0.589 |
| -1.865000000000067 | -1.382 | -0.833 | -0.587 |
| -1.860000000000067 | -1.379 | -0.831 | -0.586 |
| -1.855000000000067 | -1.377 | -0.829 | -0.584 |
| -1.850000000000067 | -1.374 | -0.827 | -0.583 |
| -1.845000000000067 | -1.372 | -0.825 | -0.582 |
| -1.840000000000067 | -1.37 | -0.824 | -0.58 |
| -1.835000000000067 | -1.367 | -0.822 | -0.579 |
| -1.830000000000068 | -1.365 | -0.82 | -0.577 |
| -1.825000000000068 | -1.363 | -0.818 | -0.576 |
| -1.820000000000068 | -1.36 | -0.816 | -0.575 |
| -1.815000000000068 | -1.358 | -0.814 | -0.573 |
| -1.810000000000068 | -1.355 | -0.813 | -0.572 |
| -1.805000000000068 | -1.353 | -0.811 | -0.57 |
| -1.800000000000068 | -1.35 | -0.809 | -0.569 |
| -1.795000000000068 | -1.348 | -0.807 | -0.567 |
| -1.790000000000068 | -1.346 | -0.805 | -0.566 |
| -1.785000000000068 | -1.343 | -0.803 | -0.565 |
| -1.780000000000069 | -1.341 | -0.801 | -0.563 |
| -1.775000000000069 | -1.338 | -0.8 | -0.562 |
| -1.770000000000069 | -1.336 | -0.798 | -0.56 |
| -1.765000000000069 | -1.333 | -0.796 | -0.559 |
| -1.760000000000069 | -1.331 | -0.794 | -0.557 |
| -1.75500000000007 | -1.328 | -0.792 | -0.556 |
| -1.75000000000007 | -1.326 | -0.79 | -0.554 |
| -1.745000000000069 | -1.323 | -0.788 | -0.553 |
| -1.740000000000069 | -1.321 | -0.786 | -0.552 |
| -1.73500000000007 | -1.318 | -0.785 | -0.55 |
| -1.73000000000007 | -1.316 | -0.783 | -0.549 |
| -1.72500000000007 | -1.313 | -0.781 | -0.547 |
| -1.72000000000007 | -1.311 | -0.779 | -0.546 |
| -1.71500000000007 | -1.308 | -0.777 | -0.544 |
| -1.71000000000007 | -1.306 | -0.775 | -0.543 |
| -1.70500000000007 | -1.303 | -0.773 | -0.541 |
| -1.70000000000007 | -1.301 | -0.771 | -0.54 |
| -1.69500000000007 | -1.298 | -0.769 | -0.539 |
| -1.69000000000007 | -1.296 | -0.767 | -0.537 |
| -1.685000000000071 | -1.293 | -0.766 | -0.536 |
| -1.680000000000071 | -1.291 | -0.764 | -0.534 |
| -1.675000000000071 | -1.288 | -0.762 | -0.533 |
| -1.670000000000071 | -1.286 | -0.76 | -0.531 |
| -1.665000000000071 | -1.283 | -0.758 | -0.53 |
| -1.660000000000071 | -1.28 | -0.756 | -0.528 |
| -1.655000000000071 | -1.278 | -0.754 | -0.527 |
| -1.650000000000071 | -1.275 | -0.752 | -0.525 |
| -1.645000000000071 | -1.273 | -0.75 | -0.524 |
| -1.640000000000072 | -1.27 | -0.748 | -0.523 |
| -1.635000000000072 | -1.267 | -0.746 | -0.521 |
| -1.630000000000072 | -1.265 | -0.744 | -0.52 |
| -1.625000000000072 | -1.262 | -0.742 | -0.518 |
| -1.620000000000072 | -1.26 | -0.74 | -0.517 |
| -1.615000000000072 | -1.257 | -0.739 | -0.515 |
| -1.610000000000072 | -1.254 | -0.737 | -0.514 |
| -1.605000000000072 | -1.252 | -0.735 | -0.512 |
| -1.600000000000072 | -1.249 | -0.733 | -0.511 |
| -1.595000000000073 | -1.246 | -0.731 | -0.509 |
| -1.590000000000073 | -1.244 | -0.729 | -0.508 |
| -1.585000000000073 | -1.241 | -0.727 | -0.506 |
| -1.580000000000073 | -1.238 | -0.725 | -0.505 |
| -1.575000000000073 | -1.236 | -0.723 | -0.503 |
| -1.570000000000073 | -1.233 | -0.721 | -0.502 |
| -1.565000000000073 | -1.23 | -0.719 | -0.501 |
| -1.560000000000073 | -1.228 | -0.717 | -0.499 |
| -1.555000000000073 | -1.225 | -0.715 | -0.498 |
| -1.550000000000074 | -1.222 | -0.713 | -0.496 |
| -1.545000000000074 | -1.219 | -0.711 | -0.495 |
| -1.540000000000074 | -1.217 | -0.709 | -0.493 |
| -1.535000000000074 | -1.214 | -0.707 | -0.492 |
| -1.530000000000074 | -1.211 | -0.705 | -0.49 |
| -1.525000000000074 | -1.209 | -0.703 | -0.489 |
| -1.520000000000074 | -1.206 | -0.701 | -0.487 |
| -1.515000000000074 | -1.203 | -0.699 | -0.486 |
| -1.510000000000074 | -1.2 | -0.697 | -0.484 |
| -1.505000000000074 | -1.198 | -0.695 | -0.483 |
| -1.500000000000075 | -1.195 | -0.693 | -0.481 |
| -1.495000000000075 | -1.192 | -0.691 | -0.48 |
| -1.490000000000075 | -1.189 | -0.689 | -0.478 |
| -1.485000000000075 | -1.186 | -0.687 | -0.477 |
| -1.480000000000075 | -1.184 | -0.685 | -0.475 |
| -1.475000000000075 | -1.181 | -0.683 | -0.474 |
| -1.470000000000075 | -1.178 | -0.681 | -0.472 |
| -1.465000000000075 | -1.175 | -0.679 | -0.471 |
| -1.460000000000075 | -1.172 | -0.677 | -0.469 |
| -1.455000000000076 | -1.17 | -0.675 | -0.468 |
| -1.450000000000076 | -1.167 | -0.673 | -0.466 |
| -1.445000000000076 | -1.164 | -0.671 | -0.465 |
| -1.440000000000076 | -1.161 | -0.669 | -0.463 |
| -1.435000000000076 | -1.158 | -0.667 | -0.462 |
| -1.430000000000076 | -1.155 | -0.665 | -0.46 |
| -1.425000000000076 | -1.152 | -0.663 | -0.459 |
| -1.420000000000076 | -1.15 | -0.661 | -0.457 |
| -1.415000000000076 | -1.147 | -0.659 | -0.456 |
| -1.410000000000077 | -1.144 | -0.657 | -0.454 |
| -1.405000000000077 | -1.141 | -0.655 | -0.453 |
| -1.400000000000077 | -1.138 | -0.653 | -0.451 |
| -1.395000000000077 | -1.135 | -0.651 | -0.45 |
| -1.390000000000077 | -1.132 | -0.649 | -0.448 |
| -1.385000000000077 | -1.129 | -0.647 | -0.447 |
| -1.380000000000077 | -1.126 | -0.644 | -0.445 |
| -1.375000000000077 | -1.123 | -0.642 | -0.444 |
| -1.370000000000077 | -1.12 | -0.64 | -0.442 |
| -1.365000000000077 | -1.117 | -0.638 | -0.441 |
| -1.360000000000078 | -1.115 | -0.636 | -0.439 |
| -1.355000000000078 | -1.112 | -0.634 | -0.438 |
| -1.350000000000078 | -1.109 | -0.632 | -0.436 |
| -1.345000000000078 | -1.106 | -0.63 | -0.435 |
| -1.340000000000078 | -1.103 | -0.628 | -0.433 |
| -1.335000000000078 | -1.1 | -0.626 | -0.431 |
| -1.330000000000078 | -1.097 | -0.624 | -0.43 |
| -1.325000000000078 | -1.094 | -0.622 | -0.428 |
| -1.320000000000078 | -1.091 | -0.62 | -0.427 |
| -1.315000000000079 | -1.088 | -0.618 | -0.425 |
| -1.310000000000079 | -1.085 | -0.615 | -0.424 |
| -1.305000000000079 | -1.081 | -0.613 | -0.422 |
| -1.300000000000079 | -1.078 | -0.611 | -0.421 |
| -1.295000000000079 | -1.075 | -0.609 | -0.419 |
| -1.29000000000008 | -1.072 | -0.607 | -0.418 |
| -1.285000000000079 | -1.069 | -0.605 | -0.416 |
| -1.280000000000079 | -1.066 | -0.603 | -0.415 |
| -1.275000000000079 | -1.063 | -0.601 | -0.413 |
| -1.270000000000079 | -1.06 | -0.599 | -0.412 |
| -1.26500000000008 | -1.057 | -0.596 | -0.41 |
| -1.26000000000008 | -1.054 | -0.594 | -0.409 |
| -1.25500000000008 | -1.051 | -0.592 | -0.407 |
| -1.25000000000008 | -1.048 | -0.59 | -0.405 |
| -1.24500000000008 | -1.044 | -0.588 | -0.404 |
| -1.24000000000008 | -1.041 | -0.586 | -0.402 |
| -1.23500000000008 | -1.038 | -0.584 | -0.401 |
| -1.23000000000008 | -1.035 | -0.582 | -0.399 |
| -1.22500000000008 | -1.032 | -0.58 | -0.398 |
| -1.220000000000081 | -1.029 | -0.577 | -0.396 |
| -1.215000000000081 | -1.026 | -0.575 | -0.395 |
| -1.210000000000081 | -1.022 | -0.573 | -0.393 |
| -1.205000000000081 | -1.019 | -0.571 | -0.392 |
| -1.200000000000081 | -1.016 | -0.569 | -0.39 |
| -1.195000000000081 | -1.013 | -0.567 | -0.388 |
| -1.190000000000081 | -1.01 | -0.565 | -0.387 |
| -1.185000000000081 | -1.006 | -0.562 | -0.385 |
| -1.180000000000081 | -1.003 | -0.56 | -0.384 |
| -1.175000000000082 | -1 | -0.558 | -0.382 |
| -1.170000000000082 | -0.997 | -0.556 | -0.381 |
| -1.165000000000082 | -0.993 | -0.554 | -0.379 |
| -1.160000000000082 | -0.99 | -0.552 | -0.378 |
| -1.155000000000082 | -0.987 | -0.549 | -0.376 |
| -1.150000000000082 | -0.984 | -0.547 | -0.375 |
| -1.145000000000082 | -0.98 | -0.545 | -0.373 |
| -1.140000000000082 | -0.977 | -0.543 | -0.371 |
| -1.135000000000082 | -0.974 | -0.541 | -0.37 |
| -1.130000000000082 | -0.97 | -0.539 | -0.368 |
| -1.125000000000083 | -0.967 | -0.536 | -0.367 |
| -1.120000000000083 | -0.964 | -0.534 | -0.365 |
| -1.115000000000083 | -0.96 | -0.532 | -0.364 |
| -1.110000000000083 | -0.957 | -0.53 | -0.362 |
| -1.105000000000083 | -0.954 | -0.528 | -0.36 |
| -1.100000000000083 | -0.95 | -0.525 | -0.359 |
| -1.095000000000083 | -0.947 | -0.523 | -0.357 |
| -1.090000000000083 | -0.944 | -0.521 | -0.356 |
| -1.085000000000083 | -0.94 | -0.519 | -0.354 |
| -1.080000000000084 | -0.937 | -0.517 | -0.353 |
| -1.075000000000084 | -0.933 | -0.514 | -0.351 |
| -1.070000000000084 | -0.93 | -0.512 | -0.35 |
| -1.065000000000084 | -0.927 | -0.51 | -0.348 |
| -1.060000000000084 | -0.923 | -0.508 | -0.346 |
| -1.055000000000084 | -0.92 | -0.506 | -0.345 |
| -1.050000000000084 | -0.916 | -0.503 | -0.343 |
| -1.045000000000084 | -0.913 | -0.501 | -0.342 |
| -1.040000000000084 | -0.909 | -0.499 | -0.34 |
| -1.035000000000085 | -0.906 | -0.497 | -0.338 |
| -1.030000000000085 | -0.902 | -0.495 | -0.337 |
| -1.025000000000085 | -0.899 | -0.492 | -0.335 |
| -1.020000000000085 | -0.895 | -0.49 | -0.334 |
| -1.015000000000085 | -0.892 | -0.488 | -0.332 |
| -1.010000000000085 | -0.888 | -0.486 | -0.331 |
| -1.005000000000085 | -0.885 | -0.483 | -0.329 |
| -1.000000000000085 | -0.881 | -0.481 | -0.327 |
| -0.995000000000085 | -0.878 | -0.479 | -0.326 |
| -0.990000000000085 | -0.874 | -0.477 | -0.324 |
| -0.985000000000085 | -0.871 | -0.474 | -0.323 |
| -0.980000000000085 | -0.867 | -0.472 | -0.321 |
| -0.975000000000085 | -0.864 | -0.47 | -0.32 |
| -0.970000000000085 | -0.86 | -0.468 | -0.318 |
| -0.965000000000085 | -0.856 | -0.466 | -0.316 |
| -0.960000000000085 | -0.853 | -0.463 | -0.315 |
| -0.955000000000085 | -0.849 | -0.461 | -0.313 |
| -0.950000000000085 | -0.846 | -0.459 | -0.312 |
| -0.945000000000085 | -0.842 | -0.456 | -0.31 |
| -0.940000000000085 | -0.838 | -0.454 | -0.308 |
| -0.935000000000085 | -0.835 | -0.452 | -0.307 |
| -0.930000000000085 | -0.831 | -0.45 | -0.305 |
| -0.925000000000085 | -0.827 | -0.447 | -0.304 |
| -0.920000000000085 | -0.824 | -0.445 | -0.302 |
| -0.915000000000085 | -0.82 | -0.443 | -0.3 |
| -0.910000000000085 | -0.816 | -0.441 | -0.299 |
| -0.905000000000085 | -0.813 | -0.438 | -0.297 |
| -0.900000000000085 | -0.809 | -0.436 | -0.296 |
| -0.895000000000085 | -0.805 | -0.434 | -0.294 |
| -0.890000000000085 | -0.801 | -0.431 | -0.292 |
| -0.885000000000085 | -0.798 | -0.429 | -0.291 |
| -0.880000000000085 | -0.794 | -0.427 | -0.289 |
| -0.875000000000085 | -0.79 | -0.425 | -0.288 |
| -0.870000000000085 | -0.786 | -0.422 | -0.286 |
| -0.865000000000085 | -0.783 | -0.42 | -0.284 |
| -0.860000000000085 | -0.779 | -0.418 | -0.283 |
| -0.855000000000085 | -0.775 | -0.415 | -0.281 |
| -0.850000000000085 | -0.771 | -0.413 | -0.28 |
| -0.845000000000085 | -0.767 | -0.411 | -0.278 |
| -0.840000000000085 | -0.764 | -0.409 | -0.276 |
| -0.835000000000085 | -0.76 | -0.406 | -0.275 |
| -0.830000000000085 | -0.756 | -0.404 | -0.273 |
| -0.825000000000085 | -0.752 | -0.402 | -0.272 |
| -0.820000000000085 | -0.748 | -0.399 | -0.27 |
| -0.815000000000085 | -0.744 | -0.397 | -0.268 |
| -0.810000000000085 | -0.74 | -0.395 | -0.267 |
| -0.805000000000085 | -0.737 | -0.392 | -0.265 |
| -0.800000000000085 | -0.733 | -0.39 | -0.264 |
| -0.795000000000085 | -0.729 | -0.388 | -0.262 |
| -0.790000000000085 | -0.725 | -0.385 | -0.26 |
| -0.785000000000085 | -0.721 | -0.383 | -0.259 |
| -0.780000000000085 | -0.717 | -0.381 | -0.257 |
| -0.775000000000085 | -0.713 | -0.378 | -0.256 |
| -0.770000000000085 | -0.709 | -0.376 | -0.254 |
| -0.765000000000085 | -0.705 | -0.374 | -0.252 |
| -0.760000000000085 | -0.701 | -0.371 | -0.251 |
| -0.755000000000085 | -0.697 | -0.369 | -0.249 |
| -0.750000000000085 | -0.693 | -0.367 | -0.247 |
| -0.745000000000085 | -0.689 | -0.364 | -0.246 |
| -0.740000000000085 | -0.685 | -0.362 | -0.244 |
| -0.735000000000085 | -0.681 | -0.36 | -0.243 |
| -0.730000000000085 | -0.677 | -0.357 | -0.241 |
| -0.725000000000085 | -0.673 | -0.355 | -0.239 |
| -0.720000000000085 | -0.669 | -0.353 | -0.238 |
| -0.715000000000085 | -0.665 | -0.35 | -0.236 |
| -0.710000000000085 | -0.661 | -0.348 | -0.235 |
| -0.705000000000085 | -0.657 | -0.346 | -0.233 |
| -0.700000000000085 | -0.653 | -0.343 | -0.231 |
| -0.695000000000085 | -0.649 | -0.341 | -0.23 |
| -0.690000000000085 | -0.644 | -0.338 | -0.228 |
| -0.685000000000085 | -0.64 | -0.336 | -0.226 |
| -0.680000000000085 | -0.636 | -0.334 | -0.225 |
| -0.675000000000085 | -0.632 | -0.331 | -0.223 |
| -0.670000000000085 | -0.628 | -0.329 | -0.222 |
| -0.665000000000085 | -0.624 | -0.327 | -0.22 |
| -0.660000000000085 | -0.62 | -0.324 | -0.218 |
| -0.655000000000085 | -0.615 | -0.322 | -0.217 |
| -0.650000000000085 | -0.611 | -0.32 | -0.215 |
| -0.645000000000085 | -0.607 | -0.317 | -0.213 |
| -0.640000000000085 | -0.603 | -0.315 | -0.212 |
| -0.635000000000085 | -0.599 | -0.312 | -0.21 |
| -0.630000000000085 | -0.594 | -0.31 | -0.208 |
| -0.625000000000085 | -0.59 | -0.308 | -0.207 |
| -0.620000000000085 | -0.586 | -0.305 | -0.205 |
| -0.615000000000085 | -0.582 | -0.303 | -0.204 |
| -0.610000000000085 | -0.577 | -0.3 | -0.202 |
| -0.605000000000085 | -0.573 | -0.298 | -0.2 |
| -0.600000000000085 | -0.569 | -0.296 | -0.199 |
| -0.595000000000085 | -0.565 | -0.293 | -0.197 |
| -0.590000000000085 | -0.56 | -0.291 | -0.195 |
| -0.585000000000085 | -0.556 | -0.288 | -0.194 |
| -0.580000000000085 | -0.552 | -0.286 | -0.192 |
| -0.575000000000085 | -0.547 | -0.284 | -0.191 |
| -0.570000000000085 | -0.543 | -0.281 | -0.189 |
| -0.565000000000085 | -0.539 | -0.279 | -0.187 |
| -0.560000000000085 | -0.534 | -0.276 | -0.186 |
| -0.555000000000085 | -0.53 | -0.274 | -0.184 |
| -0.550000000000085 | -0.525 | -0.272 | -0.182 |
| -0.545000000000085 | -0.521 | -0.269 | -0.181 |
| -0.540000000000085 | -0.517 | -0.267 | -0.179 |
| -0.535000000000085 | -0.512 | -0.264 | -0.177 |
| -0.530000000000085 | -0.508 | -0.262 | -0.176 |
| -0.525000000000085 | -0.503 | -0.26 | -0.174 |
| -0.520000000000085 | -0.499 | -0.257 | -0.172 |
| -0.515000000000085 | -0.495 | -0.255 | -0.171 |
| -0.510000000000085 | -0.49 | -0.252 | -0.169 |
| -0.505000000000085 | -0.486 | -0.25 | -0.168 |
| -0.500000000000085 | -0.481 | -0.247 | -0.166 |
| -0.495000000000085 | -0.477 | -0.245 | -0.164 |
| -0.490000000000085 | -0.472 | -0.243 | -0.163 |
| -0.485000000000085 | -0.468 | -0.24 | -0.161 |
| -0.480000000000085 | -0.463 | -0.238 | -0.159 |
| -0.475000000000085 | -0.459 | -0.235 | -0.158 |
| -0.470000000000085 | -0.454 | -0.233 | -0.156 |
| -0.465000000000085 | -0.45 | -0.23 | -0.154 |
| -0.460000000000085 | -0.445 | -0.228 | -0.153 |
| -0.455000000000085 | -0.441 | -0.226 | -0.151 |
| -0.450000000000085 | -0.436 | -0.223 | -0.149 |
| -0.445000000000085 | -0.431 | -0.221 | -0.148 |
| -0.440000000000085 | -0.427 | -0.218 | -0.146 |
| -0.435000000000085 | -0.422 | -0.216 | -0.144 |
| -0.430000000000085 | -0.418 | -0.213 | -0.143 |
| -0.425000000000085 | -0.413 | -0.211 | -0.141 |
| -0.420000000000085 | -0.409 | -0.208 | -0.14 |
| -0.415000000000085 | -0.404 | -0.206 | -0.138 |
| -0.410000000000085 | -0.399 | -0.204 | -0.136 |
| -0.405000000000085 | -0.395 | -0.201 | -0.135 |
| -0.400000000000085 | -0.39 | -0.199 | -0.133 |
| -0.395000000000085 | -0.385 | -0.196 | -0.131 |
| -0.390000000000085 | -0.381 | -0.194 | -0.13 |
| -0.385000000000085 | -0.376 | -0.191 | -0.128 |
| -0.380000000000085 | -0.371 | -0.189 | -0.126 |
| -0.375000000000085 | -0.367 | -0.186 | -0.125 |
| -0.370000000000085 | -0.362 | -0.184 | -0.123 |
| -0.365000000000085 | -0.357 | -0.182 | -0.121 |
| -0.360000000000085 | -0.353 | -0.179 | -0.12 |
| -0.355000000000085 | -0.348 | -0.177 | -0.118 |
| -0.350000000000085 | -0.343 | -0.174 | -0.116 |
| -0.345000000000085 | -0.338 | -0.172 | -0.115 |
| -0.340000000000085 | -0.334 | -0.169 | -0.113 |
| -0.335000000000085 | -0.329 | -0.167 | -0.111 |
| -0.330000000000085 | -0.324 | -0.164 | -0.11 |
| -0.325000000000085 | -0.32 | -0.162 | -0.108 |
| -0.320000000000085 | -0.315 | -0.159 | -0.106 |
| -0.315000000000085 | -0.31 | -0.157 | -0.105 |
| -0.310000000000085 | -0.305 | -0.154 | -0.103 |
| -0.305000000000085 | -0.3 | -0.152 | -0.101 |
| -0.300000000000085 | -0.296 | -0.149 | -0.1 |
| -0.295000000000085 | -0.291 | -0.147 | -0.098 |
| -0.290000000000085 | -0.286 | -0.144 | -0.097 |
| -0.285000000000085 | -0.281 | -0.142 | -0.095 |
| -0.280000000000085 | -0.276 | -0.14 | -0.093 |
| -0.275000000000085 | -0.272 | -0.137 | -0.092 |
| -0.270000000000085 | -0.267 | -0.135 | -0.09 |
| -0.265000000000085 | -0.262 | -0.132 | -0.088 |
| -0.260000000000085 | -0.257 | -0.13 | -0.087 |
| -0.255000000000085 | -0.252 | -0.127 | -0.085 |
| -0.250000000000085 | -0.247 | -0.125 | -0.083 |
| -0.245000000000085 | -0.243 | -0.122 | -0.082 |
| -0.240000000000085 | -0.238 | -0.12 | -0.08 |
| -0.235000000000085 | -0.233 | -0.117 | -0.078 |
| -0.230000000000085 | -0.228 | -0.115 | -0.077 |
| -0.225000000000085 | -0.223 | -0.112 | -0.075 |
| -0.220000000000085 | -0.218 | -0.11 | -0.073 |
| -0.215000000000085 | -0.213 | -0.107 | -0.072 |
| -0.210000000000085 | -0.208 | -0.105 | -0.07 |
| -0.205000000000085 | -0.204 | -0.102 | -0.068 |
| -0.200000000000085 | -0.199 | -0.1 | -0.067 |
| -0.195000000000085 | -0.194 | -0.097 | -0.065 |
| -0.190000000000085 | -0.189 | -0.095 | -0.063 |
| -0.185000000000085 | -0.184 | -0.092 | -0.062 |
| -0.180000000000085 | -0.179 | -0.09 | -0.06 |
| -0.175000000000085 | -0.174 | -0.087 | -0.058 |
| -0.170000000000085 | -0.169 | -0.085 | -0.057 |
| -0.165000000000085 | -0.164 | -0.082 | -0.055 |
| -0.160000000000085 | -0.159 | -0.08 | -0.053 |
| -0.155000000000084 | -0.154 | -0.077 | -0.052 |
| -0.150000000000084 | -0.149 | -0.075 | -0.05 |
| -0.145000000000084 | -0.144 | -0.072 | -0.048 |
| -0.140000000000084 | -0.14 | -0.07 | -0.047 |
| -0.135000000000084 | -0.135 | -0.067 | -0.045 |
| -0.130000000000084 | -0.13 | -0.065 | -0.043 |
| -0.125000000000084 | -0.125 | -0.062 | -0.042 |
| -0.120000000000084 | -0.12 | -0.06 | -0.04 |
| -0.115000000000084 | -0.115 | -0.057 | -0.038 |
| -0.110000000000084 | -0.11 | -0.055 | -0.037 |
| -0.105000000000084 | -0.105 | -0.052 | -0.035 |
| -0.100000000000084 | -0.1 | -0.05 | -0.033 |
| -0.0950000000000844 | -0.095 | -0.047 | -0.032 |
| -0.0900000000000844 | -0.09 | -0.045 | -0.03 |
| -0.0850000000000844 | -0.085 | -0.042 | -0.028 |
| -0.0800000000000844 | -0.08 | -0.04 | -0.027 |
| -0.0750000000000844 | -0.075 | -0.037 | -0.025 |
| -0.0700000000000844 | -0.07 | -0.035 | -0.023 |
| -0.0650000000000844 | -0.065 | -0.032 | -0.022 |
| -0.0600000000000844 | -0.06 | -0.03 | -0.02 |
| -0.0550000000000844 | -0.055 | -0.027 | -0.018 |
| -0.0500000000000844 | -0.05 | -0.025 | -0.017 |
| -0.0450000000000844 | -0.045 | -0.022 | -0.015 |
| -0.0400000000000844 | -0.04 | -0.02 | -0.013 |
| -0.0350000000000844 | -0.035 | -0.017 | -0.012 |
| -0.0300000000000844 | -0.03 | -0.015 | -0.01 |
| -0.0250000000000844 | -0.025 | -0.012 | -0.008 |
| -0.0200000000000844 | -0.02 | -0.01 | -0.007 |
| -0.0150000000000844 | -0.015 | -0.007 | -0.005 |
| -0.0100000000000844 | -0.01 | -0.005 | -0.003 |
| -0.00500000000008444 | -0.005 | -0.002 | -0.002 |
| -8.4444604087075e-14 | 0 | 0 | 0 |
| 0.00499999999991555 | 0.005 | 0.002 | 0.002 |
| 0.00999999999991555 | 0.01 | 0.005 | 0.003 |
| 0.0149999999999156 | 0.015 | 0.007 | 0.005 |
| 0.0199999999999156 | 0.02 | 0.01 | 0.007 |
| 0.0249999999999156 | 0.025 | 0.012 | 0.008 |
| 0.0299999999999156 | 0.03 | 0.015 | 0.01 |
| 0.0349999999999155 | 0.035 | 0.017 | 0.012 |
| 0.0399999999999155 | 0.04 | 0.02 | 0.013 |
| 0.0449999999999155 | 0.045 | 0.022 | 0.015 |
| 0.0499999999999155 | 0.05 | 0.025 | 0.017 |
| 0.0549999999999155 | 0.055 | 0.027 | 0.018 |
| 0.0599999999999155 | 0.06 | 0.03 | 0.02 |
| 0.0649999999999155 | 0.065 | 0.032 | 0.022 |
| 0.0699999999999155 | 0.07 | 0.035 | 0.023 |
| 0.0749999999999155 | 0.075 | 0.037 | 0.025 |
| 0.0799999999999155 | 0.08 | 0.04 | 0.027 |
| 0.0849999999999155 | 0.085 | 0.042 | 0.028 |
| 0.0899999999999155 | 0.09 | 0.045 | 0.03 |
| 0.0949999999999155 | 0.095 | 0.047 | 0.032 |
| 0.0999999999999155 | 0.1 | 0.05 | 0.033 |
| 0.104999999999916 | 0.105 | 0.052 | 0.035 |
| 0.109999999999916 | 0.11 | 0.055 | 0.037 |
| 0.114999999999916 | 0.115 | 0.057 | 0.038 |
| 0.119999999999916 | 0.12 | 0.06 | 0.04 |
| 0.124999999999916 | 0.125 | 0.062 | 0.042 |
| 0.129999999999916 | 0.13 | 0.065 | 0.043 |
| 0.134999999999916 | 0.135 | 0.067 | 0.045 |
| 0.139999999999916 | 0.14 | 0.07 | 0.047 |
| 0.144999999999916 | 0.144 | 0.072 | 0.048 |
| 0.149999999999916 | 0.149 | 0.075 | 0.05 |
| 0.154999999999916 | 0.154 | 0.077 | 0.052 |
| 0.159999999999916 | 0.159 | 0.08 | 0.053 |
| 0.164999999999916 | 0.164 | 0.082 | 0.055 |
| 0.169999999999916 | 0.169 | 0.085 | 0.057 |
| 0.174999999999916 | 0.174 | 0.087 | 0.058 |
| 0.179999999999916 | 0.179 | 0.09 | 0.06 |
| 0.184999999999916 | 0.184 | 0.092 | 0.062 |
| 0.189999999999916 | 0.189 | 0.095 | 0.063 |
| 0.194999999999916 | 0.194 | 0.097 | 0.065 |
| 0.199999999999916 | 0.199 | 0.1 | 0.067 |
| 0.204999999999916 | 0.204 | 0.102 | 0.068 |
| 0.209999999999916 | 0.208 | 0.105 | 0.07 |
| 0.214999999999916 | 0.213 | 0.107 | 0.072 |
| 0.219999999999916 | 0.218 | 0.11 | 0.073 |
| 0.224999999999916 | 0.223 | 0.112 | 0.075 |
| 0.229999999999916 | 0.228 | 0.115 | 0.077 |
| 0.234999999999916 | 0.233 | 0.117 | 0.078 |
| 0.239999999999916 | 0.238 | 0.12 | 0.08 |
| 0.244999999999916 | 0.243 | 0.122 | 0.082 |
| 0.249999999999916 | 0.247 | 0.125 | 0.083 |
| 0.254999999999916 | 0.252 | 0.127 | 0.085 |
| 0.259999999999916 | 0.257 | 0.13 | 0.087 |
| 0.264999999999916 | 0.262 | 0.132 | 0.088 |
| 0.269999999999916 | 0.267 | 0.135 | 0.09 |
| 0.274999999999916 | 0.272 | 0.137 | 0.092 |
| 0.279999999999916 | 0.276 | 0.14 | 0.093 |
| 0.284999999999916 | 0.281 | 0.142 | 0.095 |
| 0.289999999999916 | 0.286 | 0.144 | 0.097 |
| 0.294999999999916 | 0.291 | 0.147 | 0.098 |
| 0.299999999999916 | 0.296 | 0.149 | 0.1 |
| 0.304999999999916 | 0.3 | 0.152 | 0.101 |
| 0.309999999999916 | 0.305 | 0.154 | 0.103 |
| 0.314999999999916 | 0.31 | 0.157 | 0.105 |
| 0.319999999999916 | 0.315 | 0.159 | 0.106 |
| 0.324999999999916 | 0.32 | 0.162 | 0.108 |
| 0.329999999999916 | 0.324 | 0.164 | 0.11 |
| 0.334999999999916 | 0.329 | 0.167 | 0.111 |
| 0.339999999999916 | 0.334 | 0.169 | 0.113 |
| 0.344999999999916 | 0.338 | 0.172 | 0.115 |
| 0.349999999999916 | 0.343 | 0.174 | 0.116 |
| 0.354999999999916 | 0.348 | 0.177 | 0.118 |
| 0.359999999999916 | 0.353 | 0.179 | 0.12 |
| 0.364999999999916 | 0.357 | 0.182 | 0.121 |
| 0.369999999999916 | 0.362 | 0.184 | 0.123 |
| 0.374999999999916 | 0.367 | 0.186 | 0.125 |
| 0.379999999999916 | 0.371 | 0.189 | 0.126 |
| 0.384999999999916 | 0.376 | 0.191 | 0.128 |
| 0.389999999999916 | 0.381 | 0.194 | 0.13 |
| 0.394999999999916 | 0.385 | 0.196 | 0.131 |
| 0.399999999999916 | 0.39 | 0.199 | 0.133 |
| 0.404999999999916 | 0.395 | 0.201 | 0.135 |
| 0.409999999999916 | 0.399 | 0.204 | 0.136 |
| 0.414999999999916 | 0.404 | 0.206 | 0.138 |
| 0.419999999999916 | 0.409 | 0.208 | 0.14 |
| 0.424999999999916 | 0.413 | 0.211 | 0.141 |
| 0.429999999999916 | 0.418 | 0.213 | 0.143 |
| 0.434999999999916 | 0.422 | 0.216 | 0.144 |
| 0.439999999999916 | 0.427 | 0.218 | 0.146 |
| 0.444999999999916 | 0.431 | 0.221 | 0.148 |
| 0.449999999999916 | 0.436 | 0.223 | 0.149 |
| 0.454999999999916 | 0.441 | 0.226 | 0.151 |
| 0.459999999999916 | 0.445 | 0.228 | 0.153 |
| 0.464999999999916 | 0.45 | 0.23 | 0.154 |
| 0.469999999999916 | 0.454 | 0.233 | 0.156 |
| 0.474999999999916 | 0.459 | 0.235 | 0.158 |
| 0.479999999999916 | 0.463 | 0.238 | 0.159 |
| 0.484999999999916 | 0.468 | 0.24 | 0.161 |
| 0.489999999999916 | 0.472 | 0.243 | 0.163 |
| 0.494999999999916 | 0.477 | 0.245 | 0.164 |
| 0.499999999999916 | 0.481 | 0.247 | 0.166 |
| 0.504999999999916 | 0.486 | 0.25 | 0.168 |
| 0.509999999999916 | 0.49 | 0.252 | 0.169 |
| 0.514999999999916 | 0.495 | 0.255 | 0.171 |
| 0.519999999999916 | 0.499 | 0.257 | 0.172 |
| 0.524999999999916 | 0.503 | 0.26 | 0.174 |
| 0.529999999999916 | 0.508 | 0.262 | 0.176 |
| 0.534999999999916 | 0.512 | 0.264 | 0.177 |
| 0.539999999999916 | 0.517 | 0.267 | 0.179 |
| 0.544999999999916 | 0.521 | 0.269 | 0.181 |
| 0.549999999999916 | 0.525 | 0.272 | 0.182 |
| 0.554999999999916 | 0.53 | 0.274 | 0.184 |
| 0.559999999999916 | 0.534 | 0.276 | 0.186 |
| 0.564999999999916 | 0.539 | 0.279 | 0.187 |
| 0.569999999999916 | 0.543 | 0.281 | 0.189 |
| 0.574999999999916 | 0.547 | 0.284 | 0.191 |
| 0.579999999999916 | 0.552 | 0.286 | 0.192 |
| 0.584999999999916 | 0.556 | 0.288 | 0.194 |
| 0.589999999999916 | 0.56 | 0.291 | 0.195 |
| 0.594999999999916 | 0.565 | 0.293 | 0.197 |
| 0.599999999999916 | 0.569 | 0.296 | 0.199 |
| 0.604999999999916 | 0.573 | 0.298 | 0.2 |
| 0.609999999999916 | 0.577 | 0.3 | 0.202 |
| 0.614999999999916 | 0.582 | 0.303 | 0.204 |
| 0.619999999999916 | 0.586 | 0.305 | 0.205 |
| 0.624999999999916 | 0.59 | 0.308 | 0.207 |
| 0.629999999999916 | 0.594 | 0.31 | 0.208 |
| 0.634999999999916 | 0.599 | 0.312 | 0.21 |
| 0.639999999999916 | 0.603 | 0.315 | 0.212 |
| 0.644999999999916 | 0.607 | 0.317 | 0.213 |
| 0.649999999999916 | 0.611 | 0.32 | 0.215 |
| 0.654999999999916 | 0.615 | 0.322 | 0.217 |
| 0.659999999999916 | 0.62 | 0.324 | 0.218 |
| 0.664999999999916 | 0.624 | 0.327 | 0.22 |
| 0.669999999999916 | 0.628 | 0.329 | 0.222 |
| 0.674999999999916 | 0.632 | 0.331 | 0.223 |
| 0.679999999999916 | 0.636 | 0.334 | 0.225 |
| 0.684999999999916 | 0.64 | 0.336 | 0.226 |
| 0.689999999999916 | 0.644 | 0.338 | 0.228 |
| 0.694999999999916 | 0.649 | 0.341 | 0.23 |
| 0.699999999999916 | 0.653 | 0.343 | 0.231 |
| 0.704999999999916 | 0.657 | 0.346 | 0.233 |
| 0.709999999999916 | 0.661 | 0.348 | 0.235 |
| 0.714999999999916 | 0.665 | 0.35 | 0.236 |
| 0.719999999999916 | 0.669 | 0.353 | 0.238 |
| 0.724999999999916 | 0.673 | 0.355 | 0.239 |
| 0.729999999999916 | 0.677 | 0.357 | 0.241 |
| 0.734999999999916 | 0.681 | 0.36 | 0.243 |
| 0.739999999999916 | 0.685 | 0.362 | 0.244 |
| 0.744999999999916 | 0.689 | 0.364 | 0.246 |
| 0.749999999999916 | 0.693 | 0.367 | 0.247 |
| 0.754999999999916 | 0.697 | 0.369 | 0.249 |
| 0.759999999999916 | 0.701 | 0.371 | 0.251 |
| 0.764999999999916 | 0.705 | 0.374 | 0.252 |
| 0.769999999999916 | 0.709 | 0.376 | 0.254 |
| 0.774999999999916 | 0.713 | 0.378 | 0.256 |
| 0.779999999999916 | 0.717 | 0.381 | 0.257 |
| 0.784999999999916 | 0.721 | 0.383 | 0.259 |
| 0.789999999999916 | 0.725 | 0.385 | 0.26 |
| 0.794999999999916 | 0.729 | 0.388 | 0.262 |
| 0.799999999999916 | 0.733 | 0.39 | 0.264 |
| 0.804999999999916 | 0.737 | 0.392 | 0.265 |
| 0.809999999999916 | 0.74 | 0.395 | 0.267 |
| 0.814999999999916 | 0.744 | 0.397 | 0.268 |
| 0.819999999999916 | 0.748 | 0.399 | 0.27 |
| 0.824999999999916 | 0.752 | 0.402 | 0.272 |
| 0.829999999999916 | 0.756 | 0.404 | 0.273 |
| 0.834999999999916 | 0.76 | 0.406 | 0.275 |
| 0.839999999999916 | 0.764 | 0.409 | 0.276 |
| 0.844999999999916 | 0.767 | 0.411 | 0.278 |
| 0.849999999999916 | 0.771 | 0.413 | 0.28 |
| 0.854999999999916 | 0.775 | 0.415 | 0.281 |
| 0.859999999999916 | 0.779 | 0.418 | 0.283 |
| 0.864999999999916 | 0.783 | 0.42 | 0.284 |
| 0.869999999999916 | 0.786 | 0.422 | 0.286 |
| 0.874999999999916 | 0.79 | 0.425 | 0.288 |
| 0.879999999999916 | 0.794 | 0.427 | 0.289 |
| 0.884999999999916 | 0.798 | 0.429 | 0.291 |
| 0.889999999999916 | 0.801 | 0.431 | 0.292 |
| 0.894999999999916 | 0.805 | 0.434 | 0.294 |
| 0.899999999999916 | 0.809 | 0.436 | 0.296 |
| 0.904999999999916 | 0.813 | 0.438 | 0.297 |
| 0.909999999999916 | 0.816 | 0.441 | 0.299 |
| 0.914999999999916 | 0.82 | 0.443 | 0.3 |
| 0.919999999999916 | 0.824 | 0.445 | 0.302 |
| 0.924999999999916 | 0.827 | 0.447 | 0.304 |
| 0.929999999999916 | 0.831 | 0.45 | 0.305 |
| 0.934999999999916 | 0.835 | 0.452 | 0.307 |
| 0.939999999999916 | 0.838 | 0.454 | 0.308 |
| 0.944999999999916 | 0.842 | 0.456 | 0.31 |
| 0.949999999999916 | 0.846 | 0.459 | 0.312 |
| 0.954999999999916 | 0.849 | 0.461 | 0.313 |
| 0.959999999999916 | 0.853 | 0.463 | 0.315 |
| 0.964999999999916 | 0.856 | 0.466 | 0.316 |
| 0.969999999999916 | 0.86 | 0.468 | 0.318 |
| 0.974999999999916 | 0.864 | 0.47 | 0.32 |
| 0.979999999999916 | 0.867 | 0.472 | 0.321 |
| 0.984999999999916 | 0.871 | 0.474 | 0.323 |
| 0.989999999999916 | 0.874 | 0.477 | 0.324 |
| 0.994999999999916 | 0.878 | 0.479 | 0.326 |
| 0.999999999999916 | 0.881 | 0.481 | 0.327 |
| 1.004999999999916 | 0.885 | 0.483 | 0.329 |
| 1.009999999999916 | 0.888 | 0.486 | 0.331 |
| 1.014999999999916 | 0.892 | 0.488 | 0.332 |
| 1.019999999999916 | 0.895 | 0.49 | 0.334 |
| 1.024999999999916 | 0.899 | 0.492 | 0.335 |
| 1.029999999999916 | 0.902 | 0.495 | 0.337 |
| 1.034999999999916 | 0.906 | 0.497 | 0.338 |
| 1.039999999999915 | 0.909 | 0.499 | 0.34 |
| 1.044999999999915 | 0.913 | 0.501 | 0.342 |
| 1.049999999999915 | 0.916 | 0.503 | 0.343 |
| 1.054999999999915 | 0.92 | 0.506 | 0.345 |
| 1.059999999999915 | 0.923 | 0.508 | 0.346 |
| 1.064999999999915 | 0.927 | 0.51 | 0.348 |
| 1.069999999999915 | 0.93 | 0.512 | 0.35 |
| 1.074999999999915 | 0.933 | 0.514 | 0.351 |
| 1.079999999999915 | 0.937 | 0.517 | 0.353 |
| 1.084999999999914 | 0.94 | 0.519 | 0.354 |
| 1.089999999999914 | 0.944 | 0.521 | 0.356 |
| 1.094999999999914 | 0.947 | 0.523 | 0.357 |
| 1.099999999999914 | 0.95 | 0.525 | 0.359 |
| 1.104999999999914 | 0.954 | 0.528 | 0.36 |
| 1.109999999999914 | 0.957 | 0.53 | 0.362 |
| 1.114999999999914 | 0.96 | 0.532 | 0.364 |
| 1.119999999999914 | 0.964 | 0.534 | 0.365 |
| 1.124999999999914 | 0.967 | 0.536 | 0.367 |
| 1.129999999999914 | 0.97 | 0.539 | 0.368 |
| 1.134999999999913 | 0.974 | 0.541 | 0.37 |
| 1.139999999999913 | 0.977 | 0.543 | 0.371 |
| 1.144999999999913 | 0.98 | 0.545 | 0.373 |
| 1.149999999999913 | 0.984 | 0.547 | 0.375 |
| 1.154999999999913 | 0.987 | 0.549 | 0.376 |
| 1.159999999999913 | 0.99 | 0.552 | 0.378 |
| 1.164999999999913 | 0.993 | 0.554 | 0.379 |
| 1.169999999999913 | 0.997 | 0.556 | 0.381 |
| 1.174999999999913 | 1 | 0.558 | 0.382 |
| 1.179999999999912 | 1.003 | 0.56 | 0.384 |
| 1.184999999999912 | 1.006 | 0.562 | 0.385 |
| 1.189999999999912 | 1.01 | 0.565 | 0.387 |
| 1.194999999999912 | 1.013 | 0.567 | 0.388 |
| 1.199999999999912 | 1.016 | 0.569 | 0.39 |
| 1.204999999999912 | 1.019 | 0.571 | 0.392 |
| 1.209999999999912 | 1.022 | 0.573 | 0.393 |
| 1.214999999999912 | 1.026 | 0.575 | 0.395 |
| 1.219999999999912 | 1.029 | 0.577 | 0.396 |
| 1.224999999999911 | 1.032 | 0.58 | 0.398 |
| 1.229999999999911 | 1.035 | 0.582 | 0.399 |
| 1.234999999999911 | 1.038 | 0.584 | 0.401 |
| 1.239999999999911 | 1.041 | 0.586 | 0.402 |
| 1.244999999999911 | 1.044 | 0.588 | 0.404 |
| 1.249999999999911 | 1.048 | 0.59 | 0.405 |
| 1.254999999999911 | 1.051 | 0.592 | 0.407 |
| 1.259999999999911 | 1.054 | 0.594 | 0.409 |
| 1.264999999999911 | 1.057 | 0.596 | 0.41 |
| 1.269999999999911 | 1.06 | 0.599 | 0.412 |
| 1.27499999999991 | 1.063 | 0.601 | 0.413 |
| 1.27999999999991 | 1.066 | 0.603 | 0.415 |
| 1.28499999999991 | 1.069 | 0.605 | 0.416 |
| 1.28999999999991 | 1.072 | 0.607 | 0.418 |
| 1.29499999999991 | 1.075 | 0.609 | 0.419 |
| 1.29999999999991 | 1.078 | 0.611 | 0.421 |
| 1.30499999999991 | 1.081 | 0.613 | 0.422 |
| 1.30999999999991 | 1.085 | 0.615 | 0.424 |
| 1.31499999999991 | 1.088 | 0.618 | 0.425 |
| 1.319999999999909 | 1.091 | 0.62 | 0.427 |
| 1.324999999999909 | 1.094 | 0.622 | 0.428 |
| 1.329999999999909 | 1.097 | 0.624 | 0.43 |
| 1.334999999999909 | 1.1 | 0.626 | 0.431 |
| 1.339999999999909 | 1.103 | 0.628 | 0.433 |
| 1.344999999999909 | 1.106 | 0.63 | 0.435 |
| 1.349999999999909 | 1.109 | 0.632 | 0.436 |
| 1.354999999999909 | 1.112 | 0.634 | 0.438 |
| 1.359999999999909 | 1.115 | 0.636 | 0.439 |
| 1.364999999999908 | 1.117 | 0.638 | 0.441 |
| 1.369999999999908 | 1.12 | 0.64 | 0.442 |
| 1.374999999999908 | 1.123 | 0.642 | 0.444 |
| 1.379999999999908 | 1.126 | 0.644 | 0.445 |
| 1.384999999999908 | 1.129 | 0.647 | 0.447 |
| 1.389999999999908 | 1.132 | 0.649 | 0.448 |
| 1.394999999999908 | 1.135 | 0.651 | 0.45 |
| 1.399999999999908 | 1.138 | 0.653 | 0.451 |
| 1.404999999999908 | 1.141 | 0.655 | 0.453 |
| 1.409999999999908 | 1.144 | 0.657 | 0.454 |
| 1.414999999999907 | 1.147 | 0.659 | 0.456 |
| 1.419999999999907 | 1.15 | 0.661 | 0.457 |
| 1.424999999999907 | 1.152 | 0.663 | 0.459 |
| 1.429999999999907 | 1.155 | 0.665 | 0.46 |
| 1.434999999999907 | 1.158 | 0.667 | 0.462 |
| 1.439999999999907 | 1.161 | 0.669 | 0.463 |
| 1.444999999999907 | 1.164 | 0.671 | 0.465 |
| 1.449999999999907 | 1.167 | 0.673 | 0.466 |
| 1.454999999999907 | 1.17 | 0.675 | 0.468 |
| 1.459999999999906 | 1.172 | 0.677 | 0.469 |
| 1.464999999999906 | 1.175 | 0.679 | 0.471 |
| 1.469999999999906 | 1.178 | 0.681 | 0.472 |
| 1.474999999999906 | 1.181 | 0.683 | 0.474 |
| 1.479999999999906 | 1.184 | 0.685 | 0.475 |
| 1.484999999999906 | 1.186 | 0.687 | 0.477 |
| 1.489999999999906 | 1.189 | 0.689 | 0.478 |
| 1.494999999999906 | 1.192 | 0.691 | 0.48 |
| 1.499999999999906 | 1.195 | 0.693 | 0.481 |
| 1.504999999999906 | 1.198 | 0.695 | 0.483 |
| 1.509999999999905 | 1.2 | 0.697 | 0.484 |
| 1.514999999999905 | 1.203 | 0.699 | 0.486 |
| 1.519999999999905 | 1.206 | 0.701 | 0.487 |
| 1.524999999999905 | 1.209 | 0.703 | 0.489 |
| 1.529999999999905 | 1.211 | 0.705 | 0.49 |
| 1.534999999999905 | 1.214 | 0.707 | 0.492 |
| 1.539999999999905 | 1.217 | 0.709 | 0.493 |
| 1.544999999999905 | 1.219 | 0.711 | 0.495 |
| 1.549999999999905 | 1.222 | 0.713 | 0.496 |
| 1.554999999999904 | 1.225 | 0.715 | 0.498 |
| 1.559999999999904 | 1.228 | 0.717 | 0.499 |
| 1.564999999999904 | 1.23 | 0.719 | 0.501 |
| 1.569999999999904 | 1.233 | 0.721 | 0.502 |
| 1.574999999999904 | 1.236 | 0.723 | 0.503 |
| 1.579999999999904 | 1.238 | 0.725 | 0.505 |
| 1.584999999999904 | 1.241 | 0.727 | 0.506 |
| 1.589999999999904 | 1.244 | 0.729 | 0.508 |
| 1.594999999999904 | 1.246 | 0.731 | 0.509 |
| 1.599999999999903 | 1.249 | 0.733 | 0.511 |
| 1.604999999999903 | 1.252 | 0.735 | 0.512 |
| 1.609999999999903 | 1.254 | 0.737 | 0.514 |
| 1.614999999999903 | 1.257 | 0.739 | 0.515 |
| 1.619999999999903 | 1.26 | 0.74 | 0.517 |
| 1.624999999999903 | 1.262 | 0.742 | 0.518 |
| 1.629999999999903 | 1.265 | 0.744 | 0.52 |
| 1.634999999999903 | 1.267 | 0.746 | 0.521 |
| 1.639999999999903 | 1.27 | 0.748 | 0.523 |
| 1.644999999999902 | 1.273 | 0.75 | 0.524 |
| 1.649999999999902 | 1.275 | 0.752 | 0.525 |
| 1.654999999999902 | 1.278 | 0.754 | 0.527 |
| 1.659999999999902 | 1.28 | 0.756 | 0.528 |
| 1.664999999999902 | 1.283 | 0.758 | 0.53 |
| 1.669999999999902 | 1.286 | 0.76 | 0.531 |
| 1.674999999999902 | 1.288 | 0.762 | 0.533 |
| 1.679999999999902 | 1.291 | 0.764 | 0.534 |
| 1.684999999999902 | 1.293 | 0.766 | 0.536 |
| 1.689999999999901 | 1.296 | 0.767 | 0.537 |
| 1.694999999999901 | 1.298 | 0.769 | 0.539 |
| 1.699999999999901 | 1.301 | 0.771 | 0.54 |
| 1.704999999999901 | 1.303 | 0.773 | 0.541 |
| 1.709999999999901 | 1.306 | 0.775 | 0.543 |
| 1.714999999999901 | 1.308 | 0.777 | 0.544 |
| 1.719999999999901 | 1.311 | 0.779 | 0.546 |
| 1.724999999999901 | 1.313 | 0.781 | 0.547 |
| 1.729999999999901 | 1.316 | 0.783 | 0.549 |
| 1.734999999999901 | 1.318 | 0.785 | 0.55 |
| 1.7399999999999 | 1.321 | 0.786 | 0.552 |
| 1.7449999999999 | 1.323 | 0.788 | 0.553 |
| 1.7499999999999 | 1.326 | 0.79 | 0.554 |
| 1.7549999999999 | 1.328 | 0.792 | 0.556 |
| 1.7599999999999 | 1.331 | 0.794 | 0.557 |
| 1.7649999999999 | 1.333 | 0.796 | 0.559 |
| 1.7699999999999 | 1.336 | 0.798 | 0.56 |
| 1.7749999999999 | 1.338 | 0.8 | 0.562 |
| 1.7799999999999 | 1.341 | 0.801 | 0.563 |
| 1.784999999999899 | 1.343 | 0.803 | 0.565 |
| 1.789999999999899 | 1.346 | 0.805 | 0.566 |
| 1.794999999999899 | 1.348 | 0.807 | 0.567 |
| 1.799999999999899 | 1.35 | 0.809 | 0.569 |
| 1.804999999999899 | 1.353 | 0.811 | 0.57 |
| 1.809999999999899 | 1.355 | 0.813 | 0.572 |
| 1.814999999999899 | 1.358 | 0.814 | 0.573 |
| 1.819999999999899 | 1.36 | 0.816 | 0.575 |
| 1.824999999999899 | 1.363 | 0.818 | 0.576 |
| 1.829999999999899 | 1.365 | 0.82 | 0.577 |
| 1.834999999999898 | 1.367 | 0.822 | 0.579 |
| 1.839999999999898 | 1.37 | 0.824 | 0.58 |
| 1.844999999999898 | 1.372 | 0.825 | 0.582 |
| 1.849999999999898 | 1.374 | 0.827 | 0.583 |
| 1.854999999999898 | 1.377 | 0.829 | 0.584 |
| 1.859999999999898 | 1.379 | 0.831 | 0.586 |
| 1.864999999999898 | 1.382 | 0.833 | 0.587 |
| 1.869999999999898 | 1.384 | 0.835 | 0.589 |
| 1.874999999999898 | 1.386 | 0.836 | 0.59 |
| 1.879999999999897 | 1.389 | 0.838 | 0.592 |
| 1.884999999999897 | 1.391 | 0.84 | 0.593 |
| 1.889999999999897 | 1.393 | 0.842 | 0.594 |
| 1.894999999999897 | 1.396 | 0.844 | 0.596 |
| 1.899999999999897 | 1.398 | 0.846 | 0.597 |
| 1.904999999999897 | 1.4 | 0.847 | 0.599 |
| 1.909999999999897 | 1.403 | 0.849 | 0.6 |
| 1.914999999999897 | 1.405 | 0.851 | 0.601 |
| 1.919999999999897 | 1.407 | 0.853 | 0.603 |
| 1.924999999999897 | 1.41 | 0.855 | 0.604 |
| 1.929999999999896 | 1.412 | 0.856 | 0.606 |
| 1.934999999999896 | 1.414 | 0.858 | 0.607 |
| 1.939999999999896 | 1.416 | 0.86 | 0.608 |
| 1.944999999999896 | 1.419 | 0.862 | 0.61 |
| 1.949999999999896 | 1.421 | 0.864 | 0.611 |
| 1.954999999999896 | 1.423 | 0.865 | 0.613 |
| 1.959999999999896 | 1.426 | 0.867 | 0.614 |
| 1.964999999999896 | 1.428 | 0.869 | 0.615 |
| 1.969999999999896 | 1.43 | 0.871 | 0.617 |
| 1.974999999999895 | 1.432 | 0.873 | 0.618 |
| 1.979999999999895 | 1.435 | 0.874 | 0.62 |
| 1.984999999999895 | 1.437 | 0.876 | 0.621 |
| 1.989999999999895 | 1.439 | 0.878 | 0.622 |
| 1.994999999999895 | 1.441 | 0.88 | 0.624 |
| 1.999999999999895 | 1.444 | 0.881 | 0.625 |
| 2.004999999999895 | 1.446 | 0.883 | 0.627 |
| 2.009999999999895 | 1.448 | 0.885 | 0.628 |
| 2.014999999999895 | 1.45 | 0.887 | 0.629 |
| 2.019999999999895 | 1.453 | 0.888 | 0.631 |
| 2.024999999999895 | 1.455 | 0.89 | 0.632 |
| 2.029999999999895 | 1.457 | 0.892 | 0.633 |
| 2.034999999999894 | 1.459 | 0.894 | 0.635 |
| 2.039999999999894 | 1.461 | 0.895 | 0.636 |
| 2.044999999999894 | 1.464 | 0.897 | 0.638 |
| 2.049999999999894 | 1.466 | 0.899 | 0.639 |
| 2.054999999999894 | 1.468 | 0.901 | 0.64 |
| 2.059999999999894 | 1.47 | 0.902 | 0.642 |
| 2.064999999999894 | 1.472 | 0.904 | 0.643 |
| 2.069999999999894 | 1.475 | 0.906 | 0.644 |
| 2.074999999999894 | 1.477 | 0.908 | 0.646 |
| 2.079999999999893 | 1.479 | 0.909 | 0.647 |
| 2.084999999999893 | 1.481 | 0.911 | 0.649 |
| 2.089999999999893 | 1.483 | 0.913 | 0.65 |
| 2.094999999999893 | 1.485 | 0.915 | 0.651 |
| 2.099999999999893 | 1.487 | 0.916 | 0.653 |
| 2.104999999999893 | 1.49 | 0.918 | 0.654 |
| 2.109999999999893 | 1.492 | 0.92 | 0.655 |
| 2.114999999999893 | 1.494 | 0.921 | 0.657 |
| 2.119999999999893 | 1.496 | 0.923 | 0.658 |
| 2.124999999999893 | 1.498 | 0.925 | 0.659 |
| 2.129999999999892 | 1.5 | 0.927 | 0.661 |
| 2.134999999999892 | 1.502 | 0.928 | 0.662 |
| 2.139999999999892 | 1.505 | 0.93 | 0.664 |
| 2.144999999999892 | 1.507 | 0.932 | 0.665 |
| 2.149999999999892 | 1.509 | 0.933 | 0.666 |
| 2.154999999999892 | 1.511 | 0.935 | 0.668 |
| 2.159999999999892 | 1.513 | 0.937 | 0.669 |
| 2.164999999999892 | 1.515 | 0.939 | 0.67 |
| 2.169999999999892 | 1.517 | 0.94 | 0.672 |
| 2.174999999999891 | 1.519 | 0.942 | 0.673 |
| 2.179999999999891 | 1.521 | 0.944 | 0.674 |
| 2.184999999999891 | 1.523 | 0.945 | 0.676 |
| 2.189999999999891 | 1.526 | 0.947 | 0.677 |
| 2.194999999999891 | 1.528 | 0.949 | 0.678 |
| 2.199999999999891 | 1.53 | 0.95 | 0.68 |
| 2.204999999999891 | 1.532 | 0.952 | 0.681 |
| 2.209999999999891 | 1.534 | 0.954 | 0.682 |
| 2.214999999999891 | 1.536 | 0.955 | 0.684 |
| 2.21999999999989 | 1.538 | 0.957 | 0.685 |
| 2.22499999999989 | 1.54 | 0.959 | 0.686 |
| 2.22999999999989 | 1.542 | 0.96 | 0.688 |
| 2.23499999999989 | 1.544 | 0.962 | 0.689 |
| 2.23999999999989 | 1.546 | 0.964 | 0.69 |
| 2.24499999999989 | 1.548 | 0.965 | 0.692 |
| 2.24999999999989 | 1.55 | 0.967 | 0.693 |
| 2.25499999999989 | 1.552 | 0.969 | 0.694 |
| 2.25999999999989 | 1.554 | 0.97 | 0.696 |
| 2.26499999999989 | 1.556 | 0.972 | 0.697 |
| 2.269999999999889 | 1.558 | 0.974 | 0.698 |
| 2.274999999999889 | 1.56 | 0.975 | 0.7 |
| 2.279999999999889 | 1.562 | 0.977 | 0.701 |
| 2.284999999999889 | 1.564 | 0.979 | 0.702 |
| 2.289999999999889 | 1.566 | 0.98 | 0.704 |
| 2.294999999999889 | 1.568 | 0.982 | 0.705 |
| 2.299999999999889 | 1.57 | 0.984 | 0.706 |
| 2.304999999999889 | 1.572 | 0.985 | 0.708 |
| 2.309999999999889 | 1.574 | 0.987 | 0.709 |
| 2.314999999999888 | 1.576 | 0.988 | 0.71 |
| 2.319999999999888 | 1.578 | 0.99 | 0.712 |
| 2.324999999999888 | 1.58 | 0.992 | 0.713 |
| 2.329999999999888 | 1.582 | 0.993 | 0.714 |
| 2.334999999999888 | 1.584 | 0.995 | 0.716 |
| 2.339999999999888 | 1.586 | 0.997 | 0.717 |
| 2.344999999999888 | 1.588 | 0.998 | 0.718 |
| 2.349999999999888 | 1.59 | 1 | 0.72 |
| 2.354999999999888 | 1.592 | 1.001 | 0.721 |
| 2.359999999999887 | 1.594 | 1.003 | 0.722 |
| 2.364999999999887 | 1.596 | 1.005 | 0.724 |
| 2.369999999999887 | 1.598 | 1.006 | 0.725 |
| 2.374999999999887 | 1.6 | 1.008 | 0.726 |
| 2.379999999999887 | 1.602 | 1.01 | 0.727 |
| 2.384999999999887 | 1.604 | 1.011 | 0.729 |
| 2.389999999999887 | 1.606 | 1.013 | 0.73 |
| 2.394999999999887 | 1.608 | 1.014 | 0.731 |
| 2.399999999999887 | 1.609 | 1.016 | 0.733 |
| 2.404999999999887 | 1.611 | 1.018 | 0.734 |
| 2.409999999999886 | 1.613 | 1.019 | 0.735 |
| 2.414999999999886 | 1.615 | 1.021 | 0.737 |
| 2.419999999999886 | 1.617 | 1.022 | 0.738 |
| 2.424999999999886 | 1.619 | 1.024 | 0.739 |
| 2.429999999999886 | 1.621 | 1.026 | 0.74 |
| 2.434999999999886 | 1.623 | 1.027 | 0.742 |
| 2.439999999999886 | 1.625 | 1.029 | 0.743 |
| 2.444999999999886 | 1.627 | 1.03 | 0.744 |
| 2.449999999999886 | 1.628 | 1.032 | 0.746 |
| 2.454999999999885 | 1.63 | 1.033 | 0.747 |
| 2.459999999999885 | 1.632 | 1.035 | 0.748 |
| 2.464999999999885 | 1.634 | 1.037 | 0.749 |
| 2.469999999999885 | 1.636 | 1.038 | 0.751 |
| 2.474999999999885 | 1.638 | 1.04 | 0.752 |
| 2.479999999999885 | 1.64 | 1.041 | 0.753 |
| 2.484999999999885 | 1.642 | 1.043 | 0.755 |
| 2.489999999999885 | 1.644 | 1.044 | 0.756 |
| 2.494999999999885 | 1.645 | 1.046 | 0.757 |
| 2.499999999999884 | 1.647 | 1.048 | 0.758 |
| 2.504999999999884 | 1.649 | 1.049 | 0.76 |
| 2.509999999999884 | 1.651 | 1.051 | 0.761 |
| 2.514999999999884 | 1.653 | 1.052 | 0.762 |
| 2.519999999999884 | 1.655 | 1.054 | 0.764 |
| 2.524999999999884 | 1.656 | 1.055 | 0.765 |
| 2.529999999999884 | 1.658 | 1.057 | 0.766 |
| 2.534999999999884 | 1.66 | 1.058 | 0.767 |
| 2.539999999999884 | 1.662 | 1.06 | 0.769 |
| 2.544999999999884 | 1.664 | 1.062 | 0.77 |
| 2.549999999999883 | 1.666 | 1.063 | 0.771 |
| 2.554999999999883 | 1.667 | 1.065 | 0.773 |
| 2.559999999999883 | 1.669 | 1.066 | 0.774 |
| 2.564999999999883 | 1.671 | 1.068 | 0.775 |
| 2.569999999999883 | 1.673 | 1.069 | 0.776 |
| 2.574999999999883 | 1.675 | 1.071 | 0.778 |
| 2.579999999999883 | 1.677 | 1.072 | 0.779 |
| 2.584999999999883 | 1.678 | 1.074 | 0.78 |
| 2.589999999999883 | 1.68 | 1.075 | 0.781 |
| 2.594999999999882 | 1.682 | 1.077 | 0.783 |
| 2.599999999999882 | 1.684 | 1.078 | 0.784 |
| 2.604999999999882 | 1.686 | 1.08 | 0.785 |
| 2.609999999999882 | 1.687 | 1.081 | 0.786 |
| 2.614999999999882 | 1.689 | 1.083 | 0.788 |
| 2.619999999999882 | 1.691 | 1.085 | 0.789 |
| 2.624999999999882 | 1.693 | 1.086 | 0.79 |
| 2.629999999999882 | 1.694 | 1.088 | 0.791 |
| 2.634999999999882 | 1.696 | 1.089 | 0.793 |
| 2.639999999999881 | 1.698 | 1.091 | 0.794 |
| 2.644999999999881 | 1.7 | 1.092 | 0.795 |
| 2.649999999999881 | 1.702 | 1.094 | 0.796 |
| 2.654999999999881 | 1.703 | 1.095 | 0.798 |
| 2.659999999999881 | 1.705 | 1.097 | 0.799 |
| 2.664999999999881 | 1.707 | 1.098 | 0.8 |
| 2.669999999999881 | 1.709 | 1.1 | 0.801 |
| 2.674999999999881 | 1.71 | 1.101 | 0.803 |
| 2.679999999999881 | 1.712 | 1.103 | 0.804 |
| 2.68499999999988 | 1.714 | 1.104 | 0.805 |
| 2.68999999999988 | 1.716 | 1.106 | 0.806 |
| 2.69499999999988 | 1.717 | 1.107 | 0.808 |
| 2.69999999999988 | 1.719 | 1.109 | 0.809 |
| 2.70499999999988 | 1.721 | 1.11 | 0.81 |
| 2.70999999999988 | 1.723 | 1.112 | 0.811 |
| 2.71499999999988 | 1.724 | 1.113 | 0.813 |
| 2.71999999999988 | 1.726 | 1.115 | 0.814 |
| 2.72499999999988 | 1.728 | 1.116 | 0.815 |
| 2.72999999999988 | 1.729 | 1.117 | 0.816 |
| 2.734999999999879 | 1.731 | 1.119 | 0.818 |
| 2.739999999999879 | 1.733 | 1.12 | 0.819 |
| 2.744999999999879 | 1.735 | 1.122 | 0.82 |
| 2.749999999999879 | 1.736 | 1.123 | 0.821 |
| 2.754999999999879 | 1.738 | 1.125 | 0.822 |
| 2.759999999999879 | 1.74 | 1.126 | 0.824 |
| 2.764999999999879 | 1.741 | 1.128 | 0.825 |
| 2.769999999999879 | 1.743 | 1.129 | 0.826 |
| 2.774999999999879 | 1.745 | 1.131 | 0.827 |
| 2.779999999999878 | 1.746 | 1.132 | 0.829 |
| 2.784999999999878 | 1.748 | 1.134 | 0.83 |
| 2.789999999999878 | 1.75 | 1.135 | 0.831 |
| 2.794999999999878 | 1.752 | 1.137 | 0.832 |
| 2.799999999999878 | 1.753 | 1.138 | 0.833 |
| 2.804999999999878 | 1.755 | 1.139 | 0.835 |
| 2.809999999999878 | 1.757 | 1.141 | 0.836 |
| 2.814999999999878 | 1.758 | 1.142 | 0.837 |
| 2.819999999999878 | 1.76 | 1.144 | 0.838 |
| 2.824999999999878 | 1.762 | 1.145 | 0.84 |
| 2.829999999999877 | 1.763 | 1.147 | 0.841 |
| 2.834999999999877 | 1.765 | 1.148 | 0.842 |
| 2.839999999999877 | 1.767 | 1.15 | 0.843 |
| 2.844999999999877 | 1.768 | 1.151 | 0.844 |
| 2.849999999999877 | 1.77 | 1.152 | 0.846 |
| 2.854999999999877 | 1.772 | 1.154 | 0.847 |
| 2.859999999999877 | 1.773 | 1.155 | 0.848 |
| 2.864999999999877 | 1.775 | 1.157 | 0.849 |
| 2.869999999999877 | 1.777 | 1.158 | 0.85 |
| 2.874999999999876 | 1.778 | 1.16 | 0.852 |
| 2.879999999999876 | 1.78 | 1.161 | 0.853 |
| 2.884999999999876 | 1.781 | 1.162 | 0.854 |
| 2.889999999999876 | 1.783 | 1.164 | 0.855 |
| 2.894999999999876 | 1.785 | 1.165 | 0.856 |
| 2.899999999999876 | 1.786 | 1.167 | 0.858 |
| 2.904999999999876 | 1.788 | 1.168 | 0.859 |
| 2.909999999999876 | 1.79 | 1.17 | 0.86 |
| 2.914999999999876 | 1.791 | 1.171 | 0.861 |
| 2.919999999999876 | 1.793 | 1.172 | 0.862 |
| 2.924999999999875 | 1.794 | 1.174 | 0.864 |
| 2.929999999999875 | 1.796 | 1.175 | 0.865 |
| 2.934999999999875 | 1.798 | 1.177 | 0.866 |
| 2.939999999999875 | 1.799 | 1.178 | 0.867 |
| 2.944999999999875 | 1.801 | 1.179 | 0.868 |
| 2.949999999999875 | 1.803 | 1.181 | 0.87 |
| 2.954999999999875 | 1.804 | 1.182 | 0.871 |
| 2.959999999999875 | 1.806 | 1.184 | 0.872 |
| 2.964999999999875 | 1.807 | 1.185 | 0.873 |
| 2.969999999999874 | 1.809 | 1.186 | 0.874 |
| 2.974999999999874 | 1.811 | 1.188 | 0.875 |
| 2.979999999999874 | 1.812 | 1.189 | 0.877 |
| 2.984999999999874 | 1.814 | 1.191 | 0.878 |
| 2.989999999999874 | 1.815 | 1.192 | 0.879 |
| 2.994999999999874 | 1.817 | 1.193 | 0.88 |
| 2.999999999999874 | 1.818 | 1.195 | 0.881 |
| 3.004999999999874 | 1.82 | 1.196 | 0.883 |
| 3.009999999999874 | 1.822 | 1.198 | 0.884 |
| 3.014999999999874 | 1.823 | 1.199 | 0.885 |
| 3.019999999999873 | 1.825 | 1.2 | 0.886 |
| 3.024999999999873 | 1.826 | 1.202 | 0.887 |
| 3.029999999999873 | 1.828 | 1.203 | 0.888 |
| 3.034999999999873 | 1.829 | 1.204 | 0.89 |
| 3.039999999999873 | 1.831 | 1.206 | 0.891 |
| 3.044999999999873 | 1.833 | 1.207 | 0.892 |
| 3.049999999999873 | 1.834 | 1.209 | 0.893 |
| 3.054999999999873 | 1.836 | 1.21 | 0.894 |
| 3.059999999999873 | 1.837 | 1.211 | 0.895 |
| 3.064999999999872 | 1.839 | 1.213 | 0.897 |
| 3.069999999999872 | 1.84 | 1.214 | 0.898 |
| 3.074999999999872 | 1.842 | 1.215 | 0.899 |
| 3.079999999999872 | 1.843 | 1.217 | 0.9 |
| 3.084999999999872 | 1.845 | 1.218 | 0.901 |
| 3.089999999999872 | 1.847 | 1.219 | 0.902 |
| 3.094999999999872 | 1.848 | 1.221 | 0.904 |
| 3.099999999999872 | 1.85 | 1.222 | 0.905 |
| 3.104999999999872 | 1.851 | 1.224 | 0.906 |
| 3.109999999999872 | 1.853 | 1.225 | 0.907 |
| 3.114999999999871 | 1.854 | 1.226 | 0.908 |
| 3.119999999999871 | 1.856 | 1.228 | 0.909 |
| 3.124999999999871 | 1.857 | 1.229 | 0.911 |
| 3.129999999999871 | 1.859 | 1.23 | 0.912 |
| 3.134999999999871 | 1.86 | 1.232 | 0.913 |
| 3.139999999999871 | 1.862 | 1.233 | 0.914 |
| 3.144999999999871 | 1.863 | 1.234 | 0.915 |
| 3.149999999999871 | 1.865 | 1.236 | 0.916 |
| 3.154999999999871 | 1.866 | 1.237 | 0.917 |
| 3.15999999999987 | 1.868 | 1.238 | 0.919 |
| 3.16499999999987 | 1.869 | 1.24 | 0.92 |
| 3.16999999999987 | 1.871 | 1.241 | 0.921 |
| 3.17499999999987 | 1.872 | 1.242 | 0.922 |
| 3.17999999999987 | 1.874 | 1.244 | 0.923 |
| 3.18499999999987 | 1.875 | 1.245 | 0.924 |
| 3.18999999999987 | 1.877 | 1.246 | 0.925 |
| 3.19499999999987 | 1.878 | 1.248 | 0.927 |
| 3.19999999999987 | 1.88 | 1.249 | 0.928 |
| 3.204999999999869 | 1.881 | 1.25 | 0.929 |
| 3.209999999999869 | 1.883 | 1.252 | 0.93 |
| 3.214999999999869 | 1.884 | 1.253 | 0.931 |
| 3.219999999999869 | 1.886 | 1.254 | 0.932 |
| 3.224999999999869 | 1.887 | 1.256 | 0.933 |
| 3.229999999999869 | 1.889 | 1.257 | 0.935 |
| 3.234999999999869 | 1.89 | 1.258 | 0.936 |
| 3.239999999999869 | 1.892 | 1.26 | 0.937 |
| 3.244999999999869 | 1.893 | 1.261 | 0.938 |
| 3.249999999999869 | 1.895 | 1.262 | 0.939 |
| 3.254999999999868 | 1.896 | 1.263 | 0.94 |
| 3.259999999999868 | 1.898 | 1.265 | 0.941 |
| 3.264999999999868 | 1.899 | 1.266 | 0.942 |
| 3.269999999999868 | 1.901 | 1.267 | 0.944 |
| 3.274999999999868 | 1.902 | 1.269 | 0.945 |
| 3.279999999999868 | 1.903 | 1.27 | 0.946 |
| 3.284999999999868 | 1.905 | 1.271 | 0.947 |
| 3.289999999999868 | 1.906 | 1.273 | 0.948 |
| 3.294999999999868 | 1.908 | 1.274 | 0.949 |
| 3.299999999999867 | 1.909 | 1.275 | 0.95 |
| 3.304999999999867 | 1.911 | 1.276 | 0.951 |
| 3.309999999999867 | 1.912 | 1.278 | 0.953 |
| 3.314999999999867 | 1.914 | 1.279 | 0.954 |
| 3.319999999999867 | 1.915 | 1.28 | 0.955 |
| 3.324999999999867 | 1.916 | 1.282 | 0.956 |
| 3.329999999999867 | 1.918 | 1.283 | 0.957 |
| 3.334999999999867 | 1.919 | 1.284 | 0.958 |
| 3.339999999999867 | 1.921 | 1.286 | 0.959 |
| 3.344999999999866 | 1.922 | 1.287 | 0.96 |
| 3.349999999999866 | 1.924 | 1.288 | 0.962 |
| 3.354999999999866 | 1.925 | 1.289 | 0.963 |
| 3.359999999999866 | 1.927 | 1.291 | 0.964 |
| 3.364999999999866 | 1.928 | 1.292 | 0.965 |
| 3.369999999999866 | 1.929 | 1.293 | 0.966 |
| 3.374999999999866 | 1.931 | 1.294 | 0.967 |
| 3.379999999999866 | 1.932 | 1.296 | 0.968 |
| 3.384999999999866 | 1.934 | 1.297 | 0.969 |
| 3.389999999999866 | 1.935 | 1.298 | 0.97 |
| 3.394999999999865 | 1.936 | 1.3 | 0.971 |
| 3.399999999999865 | 1.938 | 1.301 | 0.973 |
| 3.404999999999865 | 1.939 | 1.302 | 0.974 |
| 3.409999999999865 | 1.941 | 1.303 | 0.975 |
| 3.414999999999865 | 1.942 | 1.305 | 0.976 |
| 3.419999999999865 | 1.944 | 1.306 | 0.977 |
| 3.424999999999865 | 1.945 | 1.307 | 0.978 |
| 3.429999999999865 | 1.946 | 1.308 | 0.979 |
| 3.434999999999865 | 1.948 | 1.31 | 0.98 |
| 3.439999999999864 | 1.949 | 1.311 | 0.981 |
| 3.444999999999864 | 1.951 | 1.312 | 0.982 |
| 3.449999999999864 | 1.952 | 1.313 | 0.984 |
| 3.454999999999864 | 1.953 | 1.315 | 0.985 |
| 3.459999999999864 | 1.955 | 1.316 | 0.986 |
| 3.464999999999864 | 1.956 | 1.317 | 0.987 |
| 3.469999999999864 | 1.957 | 1.318 | 0.988 |
| 3.474999999999864 | 1.959 | 1.32 | 0.989 |
| 3.479999999999864 | 1.96 | 1.321 | 0.99 |
| 3.484999999999864 | 1.962 | 1.322 | 0.991 |
| 3.489999999999863 | 1.963 | 1.323 | 0.992 |
| 3.494999999999863 | 1.964 | 1.325 | 0.993 |
| 3.499999999999863 | 1.966 | 1.326 | 0.994 |
| 3.504999999999863 | 1.967 | 1.327 | 0.996 |
| 3.509999999999863 | 1.968 | 1.328 | 0.997 |
| 3.514999999999863 | 1.97 | 1.33 | 0.998 |
| 3.519999999999863 | 1.971 | 1.331 | 0.999 |
| 3.524999999999863 | 1.973 | 1.332 | 1 |
| 3.529999999999863 | 1.974 | 1.333 | 1.001 |
| 3.534999999999862 | 1.975 | 1.335 | 1.002 |
| 3.539999999999862 | 1.977 | 1.336 | 1.003 |
| 3.544999999999862 | 1.978 | 1.337 | 1.004 |
| 3.549999999999862 | 1.979 | 1.338 | 1.005 |
| 3.554999999999862 | 1.981 | 1.339 | 1.006 |
| 3.559999999999862 | 1.982 | 1.341 | 1.007 |
| 3.564999999999862 | 1.983 | 1.342 | 1.008 |
| 3.569999999999862 | 1.985 | 1.343 | 1.01 |
| 3.574999999999862 | 1.986 | 1.344 | 1.011 |
| 3.579999999999862 | 1.987 | 1.346 | 1.012 |
| 3.584999999999861 | 1.989 | 1.347 | 1.013 |
| 3.589999999999861 | 1.99 | 1.348 | 1.014 |
| 3.594999999999861 | 1.991 | 1.349 | 1.015 |
| 3.599999999999861 | 1.993 | 1.35 | 1.016 |
| 3.604999999999861 | 1.994 | 1.352 | 1.017 |
| 3.609999999999861 | 1.996 | 1.353 | 1.018 |
| 3.614999999999861 | 1.997 | 1.354 | 1.019 |
| 3.619999999999861 | 1.998 | 1.355 | 1.02 |
| 3.62499999999986 | 2 | 1.356 | 1.021 |
| 3.62999999999986 | 2.001 | 1.358 | 1.022 |
| 3.63499999999986 | 2.002 | 1.359 | 1.023 |
| 3.63999999999986 | 2.003 | 1.36 | 1.024 |
| 3.64499999999986 | 2.005 | 1.361 | 1.026 |
| 3.64999999999986 | 2.006 | 1.363 | 1.027 |
| 3.65499999999986 | 2.007 | 1.364 | 1.028 |
| 3.65999999999986 | 2.009 | 1.365 | 1.029 |
| 3.66499999999986 | 2.01 | 1.366 | 1.03 |
| 3.669999999999859 | 2.011 | 1.367 | 1.031 |
| 3.674999999999859 | 2.013 | 1.369 | 1.032 |
| 3.679999999999859 | 2.014 | 1.37 | 1.033 |
| 3.684999999999859 | 2.015 | 1.371 | 1.034 |
| 3.689999999999859 | 2.017 | 1.372 | 1.035 |
| 3.694999999999859 | 2.018 | 1.373 | 1.036 |
| 3.699999999999859 | 2.019 | 1.374 | 1.037 |
| 3.704999999999859 | 2.021 | 1.376 | 1.038 |
| 3.709999999999859 | 2.022 | 1.377 | 1.039 |
| 3.714999999999859 | 2.023 | 1.378 | 1.04 |
| 3.719999999999858 | 2.024 | 1.379 | 1.041 |
| 3.724999999999858 | 2.026 | 1.38 | 1.042 |
| 3.729999999999858 | 2.027 | 1.382 | 1.043 |
| 3.734999999999858 | 2.028 | 1.383 | 1.044 |
| 3.739999999999858 | 2.03 | 1.384 | 1.046 |
| 3.744999999999858 | 2.031 | 1.385 | 1.047 |
| 3.749999999999858 | 2.032 | 1.386 | 1.048 |
| 3.754999999999858 | 2.034 | 1.387 | 1.049 |
| 3.759999999999858 | 2.035 | 1.389 | 1.05 |
| 3.764999999999857 | 2.036 | 1.39 | 1.051 |
| 3.769999999999857 | 2.037 | 1.391 | 1.052 |
| 3.774999999999857 | 2.039 | 1.392 | 1.053 |
| 3.779999999999857 | 2.04 | 1.393 | 1.054 |
| 3.784999999999857 | 2.041 | 1.394 | 1.055 |
| 3.789999999999857 | 2.042 | 1.396 | 1.056 |
| 3.794999999999857 | 2.044 | 1.397 | 1.057 |
| 3.799999999999857 | 2.045 | 1.398 | 1.058 |
| 3.804999999999857 | 2.046 | 1.399 | 1.059 |
| 3.809999999999857 | 2.048 | 1.4 | 1.06 |
| 3.814999999999856 | 2.049 | 1.401 | 1.061 |
| 3.819999999999856 | 2.05 | 1.403 | 1.062 |
| 3.824999999999856 | 2.051 | 1.404 | 1.063 |
| 3.829999999999856 | 2.053 | 1.405 | 1.064 |
| 3.834999999999856 | 2.054 | 1.406 | 1.065 |
| 3.839999999999856 | 2.055 | 1.407 | 1.066 |
| 3.844999999999856 | 2.056 | 1.408 | 1.067 |
| 3.849999999999856 | 2.058 | 1.41 | 1.068 |
| 3.854999999999856 | 2.059 | 1.411 | 1.069 |
| 3.859999999999855 | 2.06 | 1.412 | 1.07 |
| 3.864999999999855 | 2.061 | 1.413 | 1.071 |
| 3.869999999999855 | 2.063 | 1.414 | 1.072 |
| 3.874999999999855 | 2.064 | 1.415 | 1.073 |
| 3.879999999999855 | 2.065 | 1.416 | 1.074 |
| 3.884999999999855 | 2.066 | 1.418 | 1.075 |
| 3.889999999999855 | 2.068 | 1.419 | 1.076 |
| 3.894999999999855 | 2.069 | 1.42 | 1.077 |
| 3.899999999999855 | 2.07 | 1.421 | 1.078 |
| 3.904999999999855 | 2.071 | 1.422 | 1.079 |
| 3.909999999999854 | 2.073 | 1.423 | 1.08 |
| 3.914999999999854 | 2.074 | 1.424 | 1.081 |
| 3.919999999999854 | 2.075 | 1.426 | 1.083 |
| 3.924999999999854 | 2.076 | 1.427 | 1.084 |
| 3.929999999999854 | 2.078 | 1.428 | 1.085 |
| 3.934999999999854 | 2.079 | 1.429 | 1.086 |
| 3.939999999999854 | 2.08 | 1.43 | 1.087 |
| 3.944999999999854 | 2.081 | 1.431 | 1.088 |
| 3.949999999999854 | 2.083 | 1.432 | 1.089 |
| 3.954999999999853 | 2.084 | 1.434 | 1.09 |
| 3.959999999999853 | 2.085 | 1.435 | 1.091 |
| 3.964999999999853 | 2.086 | 1.436 | 1.092 |
| 3.969999999999853 | 2.087 | 1.437 | 1.093 |
| 3.974999999999853 | 2.089 | 1.438 | 1.094 |
| 3.979999999999853 | 2.09 | 1.439 | 1.095 |
| 3.984999999999853 | 2.091 | 1.44 | 1.096 |
| 3.989999999999853 | 2.092 | 1.441 | 1.097 |
| 3.994999999999853 | 2.093 | 1.443 | 1.098 |
| 3.999999999999853 | 2.095 | 1.444 | 1.099 |
| 4.004999999999852 | 2.096 | 1.445 | 1.1 |
| 4.009999999999852 | 2.097 | 1.446 | 1.101 |
| 4.014999999999852 | 2.098 | 1.447 | 1.102 |
| 4.019999999999852 | 2.1 | 1.448 | 1.103 |
| 4.024999999999852 | 2.101 | 1.449 | 1.104 |
| 4.029999999999852 | 2.102 | 1.45 | 1.105 |
| 4.034999999999852 | 2.103 | 1.451 | 1.106 |
| 4.039999999999851 | 2.104 | 1.453 | 1.107 |
| 4.044999999999852 | 2.106 | 1.454 | 1.108 |
| 4.049999999999851 | 2.107 | 1.455 | 1.109 |
| 4.054999999999851 | 2.108 | 1.456 | 1.11 |
| 4.059999999999851 | 2.109 | 1.457 | 1.111 |
| 4.064999999999851 | 2.11 | 1.458 | 1.112 |
| 4.069999999999851 | 2.112 | 1.459 | 1.113 |
| 4.074999999999851 | 2.113 | 1.46 | 1.114 |
| 4.07999999999985 | 2.114 | 1.461 | 1.115 |
| 4.084999999999851 | 2.115 | 1.462 | 1.115 |
| 4.08999999999985 | 2.116 | 1.464 | 1.116 |
| 4.094999999999851 | 2.117 | 1.465 | 1.117 |
| 4.09999999999985 | 2.119 | 1.466 | 1.118 |
| 4.10499999999985 | 2.12 | 1.467 | 1.119 |
| 4.10999999999985 | 2.121 | 1.468 | 1.12 |
| 4.11499999999985 | 2.122 | 1.469 | 1.121 |
| 4.11999999999985 | 2.123 | 1.47 | 1.122 |
| 4.12499999999985 | 2.125 | 1.471 | 1.123 |
| 4.12999999999985 | 2.126 | 1.472 | 1.124 |
| 4.13499999999985 | 2.127 | 1.473 | 1.125 |
| 4.13999999999985 | 2.128 | 1.475 | 1.126 |
| 4.144999999999849 | 2.129 | 1.476 | 1.127 |
| 4.14999999999985 | 2.13 | 1.477 | 1.128 |
| 4.154999999999849 | 2.132 | 1.478 | 1.129 |
| 4.15999999999985 | 2.133 | 1.479 | 1.13 |
| 4.164999999999849 | 2.134 | 1.48 | 1.131 |
| 4.169999999999849 | 2.135 | 1.481 | 1.132 |
| 4.174999999999849 | 2.136 | 1.482 | 1.133 |
| 4.179999999999848 | 2.137 | 1.483 | 1.134 |
| 4.184999999999849 | 2.139 | 1.484 | 1.135 |
| 4.189999999999848 | 2.14 | 1.485 | 1.136 |
| 4.194999999999848 | 2.141 | 1.486 | 1.137 |
| 4.199999999999848 | 2.142 | 1.487 | 1.138 |
| 4.204999999999848 | 2.143 | 1.489 | 1.139 |
| 4.209999999999848 | 2.144 | 1.49 | 1.14 |
| 4.214999999999848 | 2.146 | 1.491 | 1.141 |
| 4.219999999999847 | 2.147 | 1.492 | 1.142 |
| 4.224999999999848 | 2.148 | 1.493 | 1.143 |
| 4.229999999999847 | 2.149 | 1.494 | 1.144 |
| 4.234999999999847 | 2.15 | 1.495 | 1.145 |
| 4.239999999999847 | 2.151 | 1.496 | 1.146 |
| 4.244999999999847 | 2.152 | 1.497 | 1.147 |
| 4.249999999999847 | 2.154 | 1.498 | 1.148 |
| 4.254999999999847 | 2.155 | 1.499 | 1.149 |
| 4.259999999999846 | 2.156 | 1.5 | 1.15 |
| 4.264999999999847 | 2.157 | 1.501 | 1.151 |
| 4.269999999999846 | 2.158 | 1.502 | 1.151 |
| 4.274999999999846 | 2.159 | 1.503 | 1.152 |
| 4.279999999999846 | 2.16 | 1.505 | 1.153 |
| 4.284999999999846 | 2.162 | 1.506 | 1.154 |
| 4.289999999999846 | 2.163 | 1.507 | 1.155 |
| 4.294999999999846 | 2.164 | 1.508 | 1.156 |
| 4.299999999999846 | 2.165 | 1.509 | 1.157 |
| 4.304999999999846 | 2.166 | 1.51 | 1.158 |
| 4.309999999999845 | 2.167 | 1.511 | 1.159 |
| 4.314999999999846 | 2.168 | 1.512 | 1.16 |
| 4.319999999999845 | 2.17 | 1.513 | 1.161 |
| 4.324999999999846 | 2.171 | 1.514 | 1.162 |
| 4.329999999999845 | 2.172 | 1.515 | 1.163 |
| 4.334999999999845 | 2.173 | 1.516 | 1.164 |
| 4.339999999999845 | 2.174 | 1.517 | 1.165 |
| 4.344999999999845 | 2.175 | 1.518 | 1.166 |
| 4.349999999999845 | 2.176 | 1.519 | 1.167 |
| 4.354999999999845 | 2.177 | 1.52 | 1.168 |
| 4.359999999999844 | 2.179 | 1.521 | 1.169 |
| 4.364999999999845 | 2.18 | 1.522 | 1.17 |
| 4.369999999999844 | 2.181 | 1.523 | 1.17 |
| 4.374999999999844 | 2.182 | 1.524 | 1.171 |
| 4.379999999999844 | 2.183 | 1.526 | 1.172 |
| 4.384999999999844 | 2.184 | 1.527 | 1.173 |
| 4.389999999999844 | 2.185 | 1.528 | 1.174 |
| 4.394999999999844 | 2.186 | 1.529 | 1.175 |
| 4.399999999999844 | 2.187 | 1.53 | 1.176 |
| 4.404999999999844 | 2.189 | 1.531 | 1.177 |
| 4.409999999999843 | 2.19 | 1.532 | 1.178 |
| 4.414999999999844 | 2.191 | 1.533 | 1.179 |
| 4.419999999999843 | 2.192 | 1.534 | 1.18 |
| 4.424999999999843 | 2.193 | 1.535 | 1.181 |
| 4.429999999999843 | 2.194 | 1.536 | 1.182 |
| 4.434999999999843 | 2.195 | 1.537 | 1.183 |
| 4.439999999999843 | 2.196 | 1.538 | 1.184 |
| 4.444999999999843 | 2.197 | 1.539 | 1.185 |
| 4.449999999999842 | 2.198 | 1.54 | 1.185 |
| 4.454999999999843 | 2.2 | 1.541 | 1.186 |
| 4.459999999999842 | 2.201 | 1.542 | 1.187 |
| 4.464999999999843 | 2.202 | 1.543 | 1.188 |
| 4.469999999999842 | 2.203 | 1.544 | 1.189 |
| 4.474999999999842 | 2.204 | 1.545 | 1.19 |
| 4.479999999999842 | 2.205 | 1.546 | 1.191 |
| 4.484999999999842 | 2.206 | 1.547 | 1.192 |
| 4.489999999999842 | 2.207 | 1.548 | 1.193 |
| 4.494999999999842 | 2.208 | 1.549 | 1.194 |
| 4.499999999999841 | 2.209 | 1.55 | 1.195 |
| 4.504999999999842 | 2.21 | 1.551 | 1.196 |
| 4.509999999999841 | 2.212 | 1.552 | 1.197 |
| 4.514999999999842 | 2.213 | 1.553 | 1.198 |
| 4.519999999999841 | 2.214 | 1.554 | 1.198 |
| 4.524999999999841 | 2.215 | 1.555 | 1.199 |
| 4.529999999999841 | 2.216 | 1.556 | 1.2 |
| 4.534999999999841 | 2.217 | 1.557 | 1.201 |
| 4.53999999999984 | 2.218 | 1.558 | 1.202 |
| 4.544999999999841 | 2.219 | 1.559 | 1.203 |
| 4.54999999999984 | 2.22 | 1.56 | 1.204 |
| 4.554999999999841 | 2.221 | 1.561 | 1.205 |
| 4.55999999999984 | 2.222 | 1.562 | 1.206 |
| 4.564999999999841 | 2.223 | 1.563 | 1.207 |
| 4.56999999999984 | 2.224 | 1.564 | 1.208 |
| 4.57499999999984 | 2.225 | 1.565 | 1.209 |
| 4.57999999999984 | 2.227 | 1.566 | 1.209 |
| 4.58499999999984 | 2.228 | 1.567 | 1.21 |
| 4.58999999999984 | 2.229 | 1.568 | 1.211 |
| 4.59499999999984 | 2.23 | 1.569 | 1.212 |
| 4.59999999999984 | 2.231 | 1.57 | 1.213 |
| 4.60499999999984 | 2.232 | 1.571 | 1.214 |
| 4.60999999999984 | 2.233 | 1.572 | 1.215 |
| 4.614999999999839 | 2.234 | 1.573 | 1.216 |
| 4.61999999999984 | 2.235 | 1.574 | 1.217 |
| 4.624999999999839 | 2.236 | 1.575 | 1.218 |
| 4.62999999999984 | 2.237 | 1.576 | 1.219 |
| 4.634999999999839 | 2.238 | 1.577 | 1.219 |
| 4.639999999999838 | 2.239 | 1.578 | 1.22 |
| 4.644999999999839 | 2.24 | 1.579 | 1.221 |
| 4.649999999999838 | 2.241 | 1.58 | 1.222 |
| 4.654999999999839 | 2.242 | 1.581 | 1.223 |
| 4.659999999999838 | 2.243 | 1.582 | 1.224 |
| 4.664999999999838 | 2.245 | 1.583 | 1.225 |
| 4.669999999999838 | 2.246 | 1.584 | 1.226 |
| 4.674999999999838 | 2.247 | 1.585 | 1.227 |
| 4.679999999999837 | 2.248 | 1.586 | 1.228 |
| 4.684999999999838 | 2.249 | 1.587 | 1.228 |
| 4.689999999999837 | 2.25 | 1.588 | 1.229 |
| 4.694999999999838 | 2.251 | 1.589 | 1.23 |
| 4.699999999999837 | 2.252 | 1.59 | 1.231 |
| 4.704999999999837 | 2.253 | 1.591 | 1.232 |
| 4.709999999999837 | 2.254 | 1.592 | 1.233 |
| 4.714999999999837 | 2.255 | 1.593 | 1.234 |
| 4.719999999999837 | 2.256 | 1.594 | 1.235 |
| 4.724999999999837 | 2.257 | 1.595 | 1.236 |
| 4.729999999999836 | 2.258 | 1.596 | 1.237 |
| 4.734999999999836 | 2.259 | 1.597 | 1.237 |
| 4.739999999999836 | 2.26 | 1.598 | 1.238 |
| 4.744999999999836 | 2.261 | 1.599 | 1.239 |
| 4.749999999999836 | 2.262 | 1.6 | 1.24 |
| 4.754999999999836 | 2.263 | 1.601 | 1.241 |
| 4.759999999999836 | 2.264 | 1.602 | 1.242 |
| 4.764999999999836 | 2.265 | 1.603 | 1.243 |
| 4.769999999999836 | 2.266 | 1.604 | 1.244 |
| 4.774999999999835 | 2.267 | 1.605 | 1.245 |
| 4.779999999999835 | 2.268 | 1.606 | 1.245 |
| 4.784999999999835 | 2.269 | 1.607 | 1.246 |
| 4.789999999999835 | 2.27 | 1.608 | 1.247 |
| 4.794999999999835 | 2.271 | 1.608 | 1.248 |
| 4.799999999999835 | 2.272 | 1.609 | 1.249 |
| 4.804999999999835 | 2.273 | 1.61 | 1.25 |
| 4.809999999999835 | 2.274 | 1.611 | 1.251 |
| 4.814999999999835 | 2.275 | 1.612 | 1.252 |
| 4.819999999999835 | 2.277 | 1.613 | 1.253 |
| 4.824999999999835 | 2.278 | 1.614 | 1.253 |
| 4.829999999999834 | 2.279 | 1.615 | 1.254 |
| 4.834999999999834 | 2.28 | 1.616 | 1.255 |
| 4.839999999999834 | 2.281 | 1.617 | 1.256 |
| 4.844999999999834 | 2.282 | 1.618 | 1.257 |
| 4.849999999999834 | 2.283 | 1.619 | 1.258 |
| 4.854999999999834 | 2.284 | 1.62 | 1.259 |
| 4.859999999999834 | 2.285 | 1.621 | 1.26 |
| 4.864999999999834 | 2.286 | 1.622 | 1.26 |
| 4.869999999999834 | 2.287 | 1.623 | 1.261 |
| 4.874999999999834 | 2.288 | 1.624 | 1.262 |
| 4.879999999999833 | 2.289 | 1.625 | 1.263 |
| 4.884999999999834 | 2.29 | 1.626 | 1.264 |
| 4.889999999999833 | 2.291 | 1.627 | 1.265 |
| 4.894999999999833 | 2.292 | 1.628 | 1.266 |
| 4.899999999999833 | 2.293 | 1.628 | 1.267 |
| 4.904999999999833 | 2.294 | 1.629 | 1.267 |
| 4.909999999999833 | 2.295 | 1.63 | 1.268 |
| 4.914999999999833 | 2.296 | 1.631 | 1.269 |
| 4.919999999999832 | 2.297 | 1.632 | 1.27 |
| 4.924999999999833 | 2.298 | 1.633 | 1.271 |
| 4.929999999999832 | 2.299 | 1.634 | 1.272 |
| 4.934999999999832 | 2.3 | 1.635 | 1.273 |
| 4.939999999999832 | 2.301 | 1.636 | 1.273 |
| 4.944999999999832 | 2.302 | 1.637 | 1.274 |
| 4.949999999999832 | 2.303 | 1.638 | 1.275 |
| 4.954999999999832 | 2.304 | 1.639 | 1.276 |
| 4.959999999999832 | 2.305 | 1.64 | 1.277 |
| 4.964999999999832 | 2.306 | 1.641 | 1.278 |
| 4.969999999999831 | 2.307 | 1.642 | 1.279 |
| 4.974999999999831 | 2.308 | 1.643 | 1.28 |
| 4.97999999999983 | 2.309 | 1.644 | 1.28 |
| 4.984999999999831 | 2.309 | 1.644 | 1.281 |
| 4.98999999999983 | 2.31 | 1.645 | 1.282 |
| 4.994999999999831 | 2.311 | 1.646 | 1.283 |
| 4.99999999999983 | 2.312 | 1.647 | 1.284 |